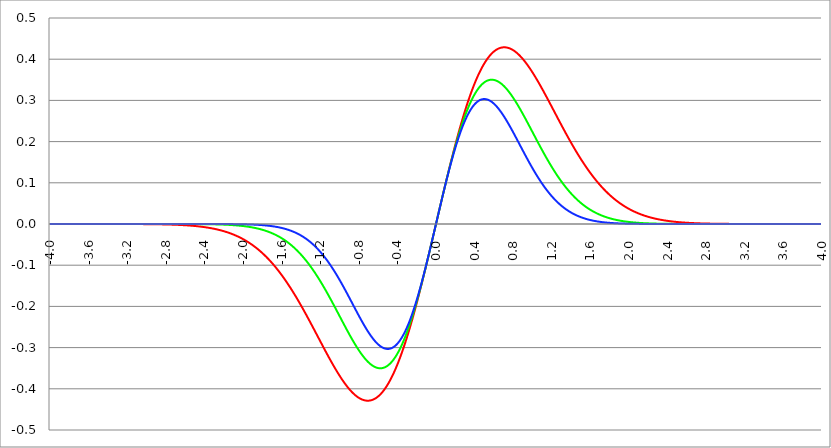
| Category | Series 1 | Series 0 | Series 2 |
|---|---|---|---|
| -4.0 | 0 | 0 | 0 |
| -3.996 | 0 | 0 | 0 |
| -3.992 | 0 | 0 | 0 |
| -3.988 | 0 | 0 | 0 |
| -3.984 | 0 | 0 | 0 |
| -3.98 | 0 | 0 | 0 |
| -3.976 | 0 | 0 | 0 |
| -3.972 | 0 | 0 | 0 |
| -3.968 | 0 | 0 | 0 |
| -3.964 | 0 | 0 | 0 |
| -3.96 | 0 | 0 | 0 |
| -3.956 | 0 | 0 | 0 |
| -3.952 | 0 | 0 | 0 |
| -3.948 | 0 | 0 | 0 |
| -3.944 | 0 | 0 | 0 |
| -3.94 | 0 | 0 | 0 |
| -3.936 | 0 | 0 | 0 |
| -3.932 | 0 | 0 | 0 |
| -3.928 | 0 | 0 | 0 |
| -3.924 | 0 | 0 | 0 |
| -3.92 | 0 | 0 | 0 |
| -3.916 | 0 | 0 | 0 |
| -3.912 | 0 | 0 | 0 |
| -3.908 | 0 | 0 | 0 |
| -3.904 | 0 | 0 | 0 |
| -3.9 | 0 | 0 | 0 |
| -3.896 | 0 | 0 | 0 |
| -3.892 | 0 | 0 | 0 |
| -3.888 | 0 | 0 | 0 |
| -3.884 | 0 | 0 | 0 |
| -3.88 | 0 | 0 | 0 |
| -3.876 | 0 | 0 | 0 |
| -3.872 | 0 | 0 | 0 |
| -3.868 | 0 | 0 | 0 |
| -3.864 | 0 | 0 | 0 |
| -3.86 | 0 | 0 | 0 |
| -3.856 | 0 | 0 | 0 |
| -3.852 | 0 | 0 | 0 |
| -3.848 | 0 | 0 | 0 |
| -3.844 | 0 | 0 | 0 |
| -3.84 | 0 | 0 | 0 |
| -3.836 | 0 | 0 | 0 |
| -3.832 | 0 | 0 | 0 |
| -3.828 | 0 | 0 | 0 |
| -3.824 | 0 | 0 | 0 |
| -3.82 | 0 | 0 | 0 |
| -3.816 | 0 | 0 | 0 |
| -3.812 | 0 | 0 | 0 |
| -3.808 | 0 | 0 | 0 |
| -3.804 | 0 | 0 | 0 |
| -3.8 | 0 | 0 | 0 |
| -3.796 | 0 | 0 | 0 |
| -3.792 | 0 | 0 | 0 |
| -3.788 | 0 | 0 | 0 |
| -3.784 | 0 | 0 | 0 |
| -3.78 | 0 | 0 | 0 |
| -3.776 | 0 | 0 | 0 |
| -3.772 | 0 | 0 | 0 |
| -3.768 | 0 | 0 | 0 |
| -3.764 | 0 | 0 | 0 |
| -3.76 | 0 | 0 | 0 |
| -3.756 | 0 | 0 | 0 |
| -3.752 | 0 | 0 | 0 |
| -3.748 | 0 | 0 | 0 |
| -3.744 | 0 | 0 | 0 |
| -3.74 | 0 | 0 | 0 |
| -3.736 | 0 | 0 | 0 |
| -3.732 | 0 | 0 | 0 |
| -3.728 | 0 | 0 | 0 |
| -3.724 | 0 | 0 | 0 |
| -3.72 | 0 | 0 | 0 |
| -3.716 | 0 | 0 | 0 |
| -3.712 | 0 | 0 | 0 |
| -3.708 | 0 | 0 | 0 |
| -3.704 | 0 | 0 | 0 |
| -3.7 | 0 | 0 | 0 |
| -3.696 | 0 | 0 | 0 |
| -3.692 | 0 | 0 | 0 |
| -3.688 | 0 | 0 | 0 |
| -3.684 | 0 | 0 | 0 |
| -3.68 | 0 | 0 | 0 |
| -3.676 | 0 | 0 | 0 |
| -3.672 | 0 | 0 | 0 |
| -3.668 | 0 | 0 | 0 |
| -3.664 | 0 | 0 | 0 |
| -3.66 | 0 | 0 | 0 |
| -3.656 | 0 | 0 | 0 |
| -3.652 | 0 | 0 | 0 |
| -3.648 | 0 | 0 | 0 |
| -3.644 | 0 | 0 | 0 |
| -3.64 | 0 | 0 | 0 |
| -3.636 | 0 | 0 | 0 |
| -3.632 | 0 | 0 | 0 |
| -3.628 | 0 | 0 | 0 |
| -3.624 | 0 | 0 | 0 |
| -3.62 | 0 | 0 | 0 |
| -3.616 | 0 | 0 | 0 |
| -3.612 | 0 | 0 | 0 |
| -3.608 | 0 | 0 | 0 |
| -3.604 | 0 | 0 | 0 |
| -3.6 | 0 | 0 | 0 |
| -3.596 | 0 | 0 | 0 |
| -3.592 | 0 | 0 | 0 |
| -3.588 | 0 | 0 | 0 |
| -3.584 | 0 | 0 | 0 |
| -3.58 | 0 | 0 | 0 |
| -3.576 | 0 | 0 | 0 |
| -3.572 | 0 | 0 | 0 |
| -3.568 | 0 | 0 | 0 |
| -3.564 | 0 | 0 | 0 |
| -3.56 | 0 | 0 | 0 |
| -3.556 | 0 | 0 | 0 |
| -3.552 | 0 | 0 | 0 |
| -3.548 | 0 | 0 | 0 |
| -3.544 | 0 | 0 | 0 |
| -3.54 | 0 | 0 | 0 |
| -3.536 | 0 | 0 | 0 |
| -3.532 | 0 | 0 | 0 |
| -3.528 | 0 | 0 | 0 |
| -3.524 | 0 | 0 | 0 |
| -3.52 | 0 | 0 | 0 |
| -3.516 | 0 | 0 | 0 |
| -3.512 | 0 | 0 | 0 |
| -3.508 | 0 | 0 | 0 |
| -3.504 | 0 | 0 | 0 |
| -3.5 | 0 | 0 | 0 |
| -3.496 | 0 | 0 | 0 |
| -3.492 | 0 | 0 | 0 |
| -3.488 | 0 | 0 | 0 |
| -3.484 | 0 | 0 | 0 |
| -3.48 | 0 | 0 | 0 |
| -3.476 | 0 | 0 | 0 |
| -3.472 | 0 | 0 | 0 |
| -3.467999999999999 | 0 | 0 | 0 |
| -3.463999999999999 | 0 | 0 | 0 |
| -3.459999999999999 | 0 | 0 | 0 |
| -3.455999999999999 | 0 | 0 | 0 |
| -3.451999999999999 | 0 | 0 | 0 |
| -3.447999999999999 | 0 | 0 | 0 |
| -3.443999999999999 | 0 | 0 | 0 |
| -3.439999999999999 | 0 | 0 | 0 |
| -3.435999999999999 | 0 | 0 | 0 |
| -3.431999999999999 | 0 | 0 | 0 |
| -3.427999999999999 | 0 | 0 | 0 |
| -3.423999999999999 | 0 | 0 | 0 |
| -3.419999999999999 | 0 | 0 | 0 |
| -3.415999999999999 | 0 | 0 | 0 |
| -3.411999999999999 | 0 | 0 | 0 |
| -3.407999999999999 | 0 | 0 | 0 |
| -3.403999999999999 | 0 | 0 | 0 |
| -3.399999999999999 | 0 | 0 | 0 |
| -3.395999999999999 | 0 | 0 | 0 |
| -3.391999999999999 | 0 | 0 | 0 |
| -3.387999999999999 | 0 | 0 | 0 |
| -3.383999999999999 | 0 | 0 | 0 |
| -3.379999999999999 | 0 | 0 | 0 |
| -3.375999999999999 | 0 | 0 | 0 |
| -3.371999999999999 | 0 | 0 | 0 |
| -3.367999999999999 | 0 | 0 | 0 |
| -3.363999999999999 | 0 | 0 | 0 |
| -3.359999999999999 | 0 | 0 | 0 |
| -3.355999999999999 | 0 | 0 | 0 |
| -3.351999999999999 | 0 | 0 | 0 |
| -3.347999999999999 | 0 | 0 | 0 |
| -3.343999999999999 | 0 | 0 | 0 |
| -3.339999999999999 | 0 | 0 | 0 |
| -3.335999999999999 | 0 | 0 | 0 |
| -3.331999999999999 | 0 | 0 | 0 |
| -3.327999999999999 | 0 | 0 | 0 |
| -3.323999999999999 | 0 | 0 | 0 |
| -3.319999999999999 | 0 | 0 | 0 |
| -3.315999999999999 | 0 | 0 | 0 |
| -3.311999999999999 | 0 | 0 | 0 |
| -3.307999999999999 | 0 | 0 | 0 |
| -3.303999999999999 | 0 | 0 | 0 |
| -3.299999999999999 | 0 | 0 | 0 |
| -3.295999999999999 | 0 | 0 | 0 |
| -3.291999999999999 | 0 | 0 | 0 |
| -3.288 | 0 | 0 | 0 |
| -3.284 | 0 | 0 | 0 |
| -3.279999999999999 | 0 | 0 | 0 |
| -3.275999999999999 | 0 | 0 | 0 |
| -3.271999999999999 | 0 | 0 | 0 |
| -3.268 | 0 | 0 | 0 |
| -3.264 | 0 | 0 | 0 |
| -3.259999999999999 | 0 | 0 | 0 |
| -3.255999999999999 | 0 | 0 | 0 |
| -3.251999999999999 | 0 | 0 | 0 |
| -3.248 | 0 | 0 | 0 |
| -3.244 | 0 | 0 | 0 |
| -3.239999999999999 | 0 | 0 | 0 |
| -3.235999999999999 | 0 | 0 | 0 |
| -3.231999999999999 | 0 | 0 | 0 |
| -3.228 | 0 | 0 | 0 |
| -3.224 | 0 | 0 | 0 |
| -3.219999999999999 | 0 | 0 | 0 |
| -3.215999999999999 | 0 | 0 | 0 |
| -3.211999999999999 | 0 | 0 | 0 |
| -3.208 | 0 | 0 | 0 |
| -3.204 | 0 | 0 | 0 |
| -3.199999999999999 | 0 | 0 | 0 |
| -3.195999999999999 | 0 | 0 | 0 |
| -3.191999999999999 | 0 | 0 | 0 |
| -3.188 | 0 | 0 | 0 |
| -3.184 | 0 | 0 | 0 |
| -3.179999999999999 | 0 | 0 | 0 |
| -3.175999999999999 | 0 | 0 | 0 |
| -3.171999999999999 | 0 | 0 | 0 |
| -3.168 | 0 | 0 | 0 |
| -3.164 | 0 | 0 | 0 |
| -3.159999999999999 | 0 | 0 | 0 |
| -3.155999999999999 | 0 | 0 | 0 |
| -3.151999999999999 | 0 | 0 | 0 |
| -3.148 | 0 | 0 | 0 |
| -3.144 | 0 | 0 | 0 |
| -3.139999999999999 | 0 | 0 | 0 |
| -3.135999999999999 | 0 | 0 | 0 |
| -3.131999999999999 | 0 | 0 | 0 |
| -3.128 | 0 | 0 | 0 |
| -3.124 | 0 | 0 | 0 |
| -3.119999999999999 | 0 | 0 | 0 |
| -3.115999999999999 | 0 | 0 | 0 |
| -3.111999999999999 | 0 | 0 | 0 |
| -3.108 | 0 | 0 | 0 |
| -3.104 | 0 | 0 | 0 |
| -3.099999999999999 | 0 | 0 | 0 |
| -3.095999999999999 | 0 | 0 | 0 |
| -3.091999999999999 | 0 | 0 | 0 |
| -3.088 | 0 | 0 | 0 |
| -3.084 | 0 | 0 | 0 |
| -3.079999999999999 | 0 | 0 | 0 |
| -3.075999999999999 | 0 | 0 | 0 |
| -3.071999999999999 | 0 | 0 | 0 |
| -3.068 | 0 | 0 | 0 |
| -3.064 | 0 | 0 | 0 |
| -3.059999999999999 | 0 | 0 | 0 |
| -3.055999999999999 | 0 | 0 | 0 |
| -3.051999999999999 | 0 | 0 | 0 |
| -3.048 | 0 | 0 | 0 |
| -3.044 | 0 | 0 | 0 |
| -3.039999999999999 | 0 | 0 | 0 |
| -3.035999999999999 | 0 | 0 | 0 |
| -3.031999999999999 | 0 | 0 | 0 |
| -3.028 | 0 | 0 | 0 |
| -3.024 | 0 | 0 | 0 |
| -3.019999999999999 | 0 | 0 | 0 |
| -3.015999999999999 | 0 | 0 | 0 |
| -3.011999999999999 | 0 | 0 | 0 |
| -3.008 | 0 | 0 | 0 |
| -3.004 | 0 | 0 | 0 |
| -2.999999999999999 | 0 | 0 | 0 |
| -2.995999999999999 | 0 | 0 | 0 |
| -2.991999999999999 | 0 | 0 | 0 |
| -2.988 | 0 | 0 | 0 |
| -2.984 | 0 | 0 | 0 |
| -2.979999999999999 | 0 | 0 | 0 |
| -2.975999999999999 | 0 | 0 | 0 |
| -2.971999999999999 | 0 | 0 | 0 |
| -2.968 | 0 | 0 | 0 |
| -2.964 | 0 | 0 | 0 |
| -2.959999999999999 | 0 | 0 | 0 |
| -2.955999999999999 | 0 | 0 | 0 |
| -2.951999999999999 | 0 | 0 | 0 |
| -2.948 | 0 | 0 | 0 |
| -2.944 | -0.001 | 0 | 0 |
| -2.939999999999999 | -0.001 | 0 | 0 |
| -2.935999999999999 | -0.001 | 0 | 0 |
| -2.931999999999999 | -0.001 | 0 | 0 |
| -2.928 | -0.001 | 0 | 0 |
| -2.924 | -0.001 | 0 | 0 |
| -2.919999999999999 | -0.001 | 0 | 0 |
| -2.915999999999999 | -0.001 | 0 | 0 |
| -2.911999999999999 | -0.001 | 0 | 0 |
| -2.908 | -0.001 | 0 | 0 |
| -2.904 | -0.001 | 0 | 0 |
| -2.899999999999999 | -0.001 | 0 | 0 |
| -2.895999999999999 | -0.001 | 0 | 0 |
| -2.891999999999999 | -0.001 | 0 | 0 |
| -2.887999999999999 | -0.001 | 0 | 0 |
| -2.883999999999999 | -0.001 | 0 | 0 |
| -2.879999999999999 | -0.001 | 0 | 0 |
| -2.875999999999999 | -0.001 | 0 | 0 |
| -2.871999999999999 | -0.001 | 0 | 0 |
| -2.867999999999999 | -0.001 | 0 | 0 |
| -2.863999999999999 | -0.001 | 0 | 0 |
| -2.859999999999999 | -0.001 | 0 | 0 |
| -2.855999999999999 | -0.001 | 0 | 0 |
| -2.851999999999999 | -0.001 | 0 | 0 |
| -2.847999999999999 | -0.001 | 0 | 0 |
| -2.843999999999999 | -0.001 | 0 | 0 |
| -2.839999999999999 | -0.001 | 0 | 0 |
| -2.835999999999999 | -0.001 | 0 | 0 |
| -2.831999999999999 | -0.001 | 0 | 0 |
| -2.827999999999999 | -0.001 | 0 | 0 |
| -2.823999999999999 | -0.001 | 0 | 0 |
| -2.819999999999999 | -0.001 | 0 | 0 |
| -2.815999999999999 | -0.001 | 0 | 0 |
| -2.811999999999999 | -0.001 | 0 | 0 |
| -2.807999999999999 | -0.001 | 0 | 0 |
| -2.803999999999999 | -0.001 | 0 | 0 |
| -2.799999999999999 | -0.001 | 0 | 0 |
| -2.795999999999999 | -0.001 | 0 | 0 |
| -2.791999999999999 | -0.001 | 0 | 0 |
| -2.787999999999999 | -0.001 | 0 | 0 |
| -2.783999999999999 | -0.001 | 0 | 0 |
| -2.779999999999999 | -0.001 | 0 | 0 |
| -2.775999999999999 | -0.001 | 0 | 0 |
| -2.771999999999999 | -0.001 | 0 | 0 |
| -2.767999999999999 | -0.001 | 0 | 0 |
| -2.763999999999999 | -0.001 | 0 | 0 |
| -2.759999999999999 | -0.001 | 0 | 0 |
| -2.755999999999999 | -0.001 | 0 | 0 |
| -2.751999999999999 | -0.001 | 0 | 0 |
| -2.747999999999999 | -0.001 | 0 | 0 |
| -2.743999999999999 | -0.001 | 0 | 0 |
| -2.739999999999999 | -0.002 | 0 | 0 |
| -2.735999999999999 | -0.002 | 0 | 0 |
| -2.731999999999999 | -0.002 | 0 | 0 |
| -2.727999999999999 | -0.002 | 0 | 0 |
| -2.723999999999999 | -0.002 | 0 | 0 |
| -2.719999999999999 | -0.002 | 0 | 0 |
| -2.715999999999999 | -0.002 | 0 | 0 |
| -2.711999999999999 | -0.002 | 0 | 0 |
| -2.707999999999999 | -0.002 | 0 | 0 |
| -2.703999999999999 | -0.002 | 0 | 0 |
| -2.699999999999999 | -0.002 | 0 | 0 |
| -2.695999999999999 | -0.002 | 0 | 0 |
| -2.691999999999999 | -0.002 | 0 | 0 |
| -2.687999999999999 | -0.002 | 0 | 0 |
| -2.683999999999999 | -0.002 | 0 | 0 |
| -2.679999999999999 | -0.002 | 0 | 0 |
| -2.675999999999999 | -0.002 | 0 | 0 |
| -2.671999999999999 | -0.002 | 0 | 0 |
| -2.667999999999999 | -0.002 | 0 | 0 |
| -2.663999999999999 | -0.002 | 0 | 0 |
| -2.659999999999999 | -0.002 | 0 | 0 |
| -2.655999999999999 | -0.002 | 0 | 0 |
| -2.651999999999999 | -0.002 | 0 | 0 |
| -2.647999999999999 | -0.002 | 0 | 0 |
| -2.643999999999999 | -0.002 | 0 | 0 |
| -2.639999999999999 | -0.002 | 0 | 0 |
| -2.635999999999999 | -0.003 | 0 | 0 |
| -2.631999999999999 | -0.003 | 0 | 0 |
| -2.627999999999999 | -0.003 | 0 | 0 |
| -2.623999999999999 | -0.003 | 0 | 0 |
| -2.619999999999999 | -0.003 | 0 | 0 |
| -2.615999999999999 | -0.003 | 0 | 0 |
| -2.611999999999999 | -0.003 | 0 | 0 |
| -2.607999999999999 | -0.003 | 0 | 0 |
| -2.603999999999999 | -0.003 | 0 | 0 |
| -2.599999999999999 | -0.003 | 0 | 0 |
| -2.595999999999999 | -0.003 | 0 | 0 |
| -2.591999999999999 | -0.003 | 0 | 0 |
| -2.587999999999999 | -0.003 | 0 | 0 |
| -2.583999999999999 | -0.003 | 0 | 0 |
| -2.579999999999999 | -0.003 | 0 | 0 |
| -2.575999999999999 | -0.003 | 0 | 0 |
| -2.571999999999999 | -0.003 | 0 | 0 |
| -2.567999999999999 | -0.004 | 0 | 0 |
| -2.563999999999999 | -0.004 | 0 | 0 |
| -2.559999999999999 | -0.004 | 0 | 0 |
| -2.555999999999999 | -0.004 | 0 | 0 |
| -2.551999999999999 | -0.004 | 0 | 0 |
| -2.547999999999999 | -0.004 | 0 | 0 |
| -2.543999999999999 | -0.004 | 0 | 0 |
| -2.539999999999999 | -0.004 | 0 | 0 |
| -2.535999999999999 | -0.004 | 0 | 0 |
| -2.531999999999999 | -0.004 | 0 | 0 |
| -2.527999999999999 | -0.004 | 0 | 0 |
| -2.523999999999999 | -0.004 | 0 | 0 |
| -2.519999999999999 | -0.004 | 0 | 0 |
| -2.515999999999999 | -0.004 | 0 | 0 |
| -2.511999999999999 | -0.005 | 0 | 0 |
| -2.507999999999999 | -0.005 | 0 | 0 |
| -2.503999999999999 | -0.005 | 0 | 0 |
| -2.499999999999999 | -0.005 | 0 | 0 |
| -2.495999999999999 | -0.005 | 0 | 0 |
| -2.491999999999999 | -0.005 | 0 | 0 |
| -2.487999999999999 | -0.005 | 0 | 0 |
| -2.483999999999999 | -0.005 | 0 | 0 |
| -2.479999999999999 | -0.005 | 0 | 0 |
| -2.475999999999999 | -0.005 | 0 | 0 |
| -2.471999999999999 | -0.005 | 0 | 0 |
| -2.467999999999999 | -0.006 | 0 | 0 |
| -2.463999999999999 | -0.006 | 0 | 0 |
| -2.459999999999999 | -0.006 | 0 | 0 |
| -2.455999999999999 | -0.006 | 0 | 0 |
| -2.451999999999999 | -0.006 | 0 | 0 |
| -2.447999999999999 | -0.006 | 0 | 0 |
| -2.443999999999999 | -0.006 | 0 | 0 |
| -2.439999999999999 | -0.006 | 0 | 0 |
| -2.435999999999999 | -0.006 | 0 | 0 |
| -2.431999999999999 | -0.007 | 0 | 0 |
| -2.427999999999999 | -0.007 | 0 | 0 |
| -2.423999999999999 | -0.007 | 0 | 0 |
| -2.419999999999999 | -0.007 | 0 | 0 |
| -2.415999999999999 | -0.007 | 0 | 0 |
| -2.411999999999999 | -0.007 | 0 | 0 |
| -2.407999999999999 | -0.007 | 0 | 0 |
| -2.403999999999999 | -0.007 | 0 | 0 |
| -2.399999999999999 | -0.008 | 0 | 0 |
| -2.395999999999999 | -0.008 | 0 | 0 |
| -2.391999999999999 | -0.008 | 0 | 0 |
| -2.387999999999999 | -0.008 | 0 | 0 |
| -2.383999999999999 | -0.008 | 0 | 0 |
| -2.379999999999999 | -0.008 | 0 | 0 |
| -2.375999999999999 | -0.008 | 0 | 0 |
| -2.371999999999999 | -0.009 | -0.001 | 0 |
| -2.367999999999998 | -0.009 | -0.001 | 0 |
| -2.363999999999998 | -0.009 | -0.001 | 0 |
| -2.359999999999998 | -0.009 | -0.001 | 0 |
| -2.355999999999998 | -0.009 | -0.001 | 0 |
| -2.351999999999998 | -0.009 | -0.001 | 0 |
| -2.347999999999998 | -0.009 | -0.001 | 0 |
| -2.343999999999998 | -0.01 | -0.001 | 0 |
| -2.339999999999998 | -0.01 | -0.001 | 0 |
| -2.335999999999998 | -0.01 | -0.001 | 0 |
| -2.331999999999998 | -0.01 | -0.001 | 0 |
| -2.327999999999998 | -0.01 | -0.001 | 0 |
| -2.323999999999998 | -0.01 | -0.001 | 0 |
| -2.319999999999998 | -0.011 | -0.001 | 0 |
| -2.315999999999998 | -0.011 | -0.001 | 0 |
| -2.311999999999998 | -0.011 | -0.001 | 0 |
| -2.307999999999998 | -0.011 | -0.001 | 0 |
| -2.303999999999998 | -0.011 | -0.001 | 0 |
| -2.299999999999998 | -0.012 | -0.001 | 0 |
| -2.295999999999998 | -0.012 | -0.001 | 0 |
| -2.291999999999998 | -0.012 | -0.001 | 0 |
| -2.287999999999998 | -0.012 | -0.001 | 0 |
| -2.283999999999998 | -0.012 | -0.001 | 0 |
| -2.279999999999998 | -0.013 | -0.001 | 0 |
| -2.275999999999998 | -0.013 | -0.001 | 0 |
| -2.271999999999998 | -0.013 | -0.001 | 0 |
| -2.267999999999998 | -0.013 | -0.001 | 0 |
| -2.263999999999998 | -0.013 | -0.001 | 0 |
| -2.259999999999998 | -0.014 | -0.001 | 0 |
| -2.255999999999998 | -0.014 | -0.001 | 0 |
| -2.251999999999998 | -0.014 | -0.001 | 0 |
| -2.247999999999998 | -0.014 | -0.001 | 0 |
| -2.243999999999998 | -0.015 | -0.001 | 0 |
| -2.239999999999998 | -0.015 | -0.001 | 0 |
| -2.235999999999998 | -0.015 | -0.001 | 0 |
| -2.231999999999998 | -0.015 | -0.001 | 0 |
| -2.227999999999998 | -0.016 | -0.001 | 0 |
| -2.223999999999998 | -0.016 | -0.001 | 0 |
| -2.219999999999998 | -0.016 | -0.001 | 0 |
| -2.215999999999998 | -0.016 | -0.001 | 0 |
| -2.211999999999998 | -0.017 | -0.001 | 0 |
| -2.207999999999998 | -0.017 | -0.001 | 0 |
| -2.203999999999998 | -0.017 | -0.002 | 0 |
| -2.199999999999998 | -0.017 | -0.002 | 0 |
| -2.195999999999998 | -0.018 | -0.002 | 0 |
| -2.191999999999998 | -0.018 | -0.002 | 0 |
| -2.187999999999998 | -0.018 | -0.002 | 0 |
| -2.183999999999998 | -0.019 | -0.002 | 0 |
| -2.179999999999998 | -0.019 | -0.002 | 0 |
| -2.175999999999998 | -0.019 | -0.002 | 0 |
| -2.171999999999998 | -0.019 | -0.002 | 0 |
| -2.167999999999998 | -0.02 | -0.002 | 0 |
| -2.163999999999998 | -0.02 | -0.002 | 0 |
| -2.159999999999998 | -0.02 | -0.002 | 0 |
| -2.155999999999998 | -0.021 | -0.002 | 0 |
| -2.151999999999998 | -0.021 | -0.002 | 0 |
| -2.147999999999998 | -0.021 | -0.002 | 0 |
| -2.143999999999998 | -0.022 | -0.002 | 0 |
| -2.139999999999998 | -0.022 | -0.002 | 0 |
| -2.135999999999998 | -0.022 | -0.002 | 0 |
| -2.131999999999998 | -0.023 | -0.002 | 0 |
| -2.127999999999998 | -0.023 | -0.002 | 0 |
| -2.123999999999998 | -0.023 | -0.002 | 0 |
| -2.119999999999998 | -0.024 | -0.003 | 0 |
| -2.115999999999998 | -0.024 | -0.003 | 0 |
| -2.111999999999998 | -0.024 | -0.003 | 0 |
| -2.107999999999998 | -0.025 | -0.003 | 0 |
| -2.103999999999998 | -0.025 | -0.003 | 0 |
| -2.099999999999998 | -0.026 | -0.003 | 0 |
| -2.095999999999998 | -0.026 | -0.003 | 0 |
| -2.091999999999998 | -0.026 | -0.003 | 0 |
| -2.087999999999998 | -0.027 | -0.003 | 0 |
| -2.083999999999998 | -0.027 | -0.003 | 0 |
| -2.079999999999998 | -0.027 | -0.003 | 0 |
| -2.075999999999998 | -0.028 | -0.003 | 0 |
| -2.071999999999998 | -0.028 | -0.003 | 0 |
| -2.067999999999998 | -0.029 | -0.003 | 0 |
| -2.063999999999998 | -0.029 | -0.003 | 0 |
| -2.059999999999998 | -0.03 | -0.004 | 0 |
| -2.055999999999998 | -0.03 | -0.004 | 0 |
| -2.051999999999998 | -0.03 | -0.004 | 0 |
| -2.047999999999998 | -0.031 | -0.004 | 0 |
| -2.043999999999998 | -0.031 | -0.004 | 0 |
| -2.039999999999998 | -0.032 | -0.004 | 0 |
| -2.035999999999998 | -0.032 | -0.004 | -0.001 |
| -2.031999999999998 | -0.033 | -0.004 | -0.001 |
| -2.027999999999998 | -0.033 | -0.004 | -0.001 |
| -2.023999999999998 | -0.034 | -0.004 | -0.001 |
| -2.019999999999998 | -0.034 | -0.004 | -0.001 |
| -2.015999999999998 | -0.035 | -0.005 | -0.001 |
| -2.011999999999998 | -0.035 | -0.005 | -0.001 |
| -2.007999999999998 | -0.036 | -0.005 | -0.001 |
| -2.003999999999998 | -0.036 | -0.005 | -0.001 |
| -1.999999999999998 | -0.037 | -0.005 | -0.001 |
| -1.995999999999998 | -0.037 | -0.005 | -0.001 |
| -1.991999999999998 | -0.038 | -0.005 | -0.001 |
| -1.987999999999998 | -0.038 | -0.005 | -0.001 |
| -1.983999999999998 | -0.039 | -0.005 | -0.001 |
| -1.979999999999998 | -0.039 | -0.006 | -0.001 |
| -1.975999999999998 | -0.04 | -0.006 | -0.001 |
| -1.971999999999998 | -0.04 | -0.006 | -0.001 |
| -1.967999999999998 | -0.041 | -0.006 | -0.001 |
| -1.963999999999998 | -0.041 | -0.006 | -0.001 |
| -1.959999999999998 | -0.042 | -0.006 | -0.001 |
| -1.955999999999998 | -0.043 | -0.006 | -0.001 |
| -1.951999999999998 | -0.043 | -0.006 | -0.001 |
| -1.947999999999998 | -0.044 | -0.007 | -0.001 |
| -1.943999999999998 | -0.044 | -0.007 | -0.001 |
| -1.939999999999998 | -0.045 | -0.007 | -0.001 |
| -1.935999999999998 | -0.046 | -0.007 | -0.001 |
| -1.931999999999998 | -0.046 | -0.007 | -0.001 |
| -1.927999999999998 | -0.047 | -0.007 | -0.001 |
| -1.923999999999998 | -0.047 | -0.007 | -0.001 |
| -1.919999999999998 | -0.048 | -0.008 | -0.001 |
| -1.915999999999998 | -0.049 | -0.008 | -0.001 |
| -1.911999999999998 | -0.049 | -0.008 | -0.001 |
| -1.907999999999998 | -0.05 | -0.008 | -0.001 |
| -1.903999999999998 | -0.051 | -0.008 | -0.001 |
| -1.899999999999998 | -0.051 | -0.008 | -0.001 |
| -1.895999999999998 | -0.052 | -0.009 | -0.001 |
| -1.891999999999998 | -0.053 | -0.009 | -0.001 |
| -1.887999999999998 | -0.053 | -0.009 | -0.002 |
| -1.883999999999998 | -0.054 | -0.009 | -0.002 |
| -1.879999999999998 | -0.055 | -0.009 | -0.002 |
| -1.875999999999998 | -0.056 | -0.01 | -0.002 |
| -1.871999999999998 | -0.056 | -0.01 | -0.002 |
| -1.867999999999998 | -0.057 | -0.01 | -0.002 |
| -1.863999999999998 | -0.058 | -0.01 | -0.002 |
| -1.859999999999998 | -0.058 | -0.01 | -0.002 |
| -1.855999999999998 | -0.059 | -0.011 | -0.002 |
| -1.851999999999998 | -0.06 | -0.011 | -0.002 |
| -1.847999999999998 | -0.061 | -0.011 | -0.002 |
| -1.843999999999998 | -0.062 | -0.011 | -0.002 |
| -1.839999999999998 | -0.062 | -0.011 | -0.002 |
| -1.835999999999998 | -0.063 | -0.012 | -0.002 |
| -1.831999999999998 | -0.064 | -0.012 | -0.002 |
| -1.827999999999998 | -0.065 | -0.012 | -0.002 |
| -1.823999999999998 | -0.065 | -0.012 | -0.002 |
| -1.819999999999998 | -0.066 | -0.013 | -0.002 |
| -1.815999999999998 | -0.067 | -0.013 | -0.002 |
| -1.811999999999998 | -0.068 | -0.013 | -0.003 |
| -1.807999999999998 | -0.069 | -0.013 | -0.003 |
| -1.803999999999998 | -0.07 | -0.014 | -0.003 |
| -1.799999999999998 | -0.07 | -0.014 | -0.003 |
| -1.795999999999998 | -0.071 | -0.014 | -0.003 |
| -1.791999999999998 | -0.072 | -0.015 | -0.003 |
| -1.787999999999998 | -0.073 | -0.015 | -0.003 |
| -1.783999999999998 | -0.074 | -0.015 | -0.003 |
| -1.779999999999998 | -0.075 | -0.015 | -0.003 |
| -1.775999999999998 | -0.076 | -0.016 | -0.003 |
| -1.771999999999998 | -0.077 | -0.016 | -0.003 |
| -1.767999999999998 | -0.078 | -0.016 | -0.003 |
| -1.763999999999998 | -0.079 | -0.017 | -0.003 |
| -1.759999999999998 | -0.079 | -0.017 | -0.004 |
| -1.755999999999998 | -0.08 | -0.017 | -0.004 |
| -1.751999999999998 | -0.081 | -0.018 | -0.004 |
| -1.747999999999998 | -0.082 | -0.018 | -0.004 |
| -1.743999999999998 | -0.083 | -0.018 | -0.004 |
| -1.739999999999998 | -0.084 | -0.019 | -0.004 |
| -1.735999999999998 | -0.085 | -0.019 | -0.004 |
| -1.731999999999998 | -0.086 | -0.019 | -0.004 |
| -1.727999999999998 | -0.087 | -0.02 | -0.004 |
| -1.723999999999998 | -0.088 | -0.02 | -0.005 |
| -1.719999999999998 | -0.089 | -0.02 | -0.005 |
| -1.715999999999998 | -0.09 | -0.021 | -0.005 |
| -1.711999999999998 | -0.091 | -0.021 | -0.005 |
| -1.707999999999998 | -0.092 | -0.021 | -0.005 |
| -1.703999999999998 | -0.093 | -0.022 | -0.005 |
| -1.699999999999998 | -0.094 | -0.022 | -0.005 |
| -1.695999999999998 | -0.096 | -0.023 | -0.005 |
| -1.691999999999998 | -0.097 | -0.023 | -0.006 |
| -1.687999999999998 | -0.098 | -0.024 | -0.006 |
| -1.683999999999998 | -0.099 | -0.024 | -0.006 |
| -1.679999999999998 | -0.1 | -0.024 | -0.006 |
| -1.675999999999998 | -0.101 | -0.025 | -0.006 |
| -1.671999999999998 | -0.102 | -0.025 | -0.006 |
| -1.667999999999998 | -0.103 | -0.026 | -0.006 |
| -1.663999999999998 | -0.104 | -0.026 | -0.007 |
| -1.659999999999998 | -0.106 | -0.027 | -0.007 |
| -1.655999999999998 | -0.107 | -0.027 | -0.007 |
| -1.651999999999998 | -0.108 | -0.028 | -0.007 |
| -1.647999999999998 | -0.109 | -0.028 | -0.007 |
| -1.643999999999998 | -0.11 | -0.029 | -0.007 |
| -1.639999999999998 | -0.111 | -0.029 | -0.008 |
| -1.635999999999998 | -0.113 | -0.03 | -0.008 |
| -1.631999999999998 | -0.114 | -0.03 | -0.008 |
| -1.627999999999998 | -0.115 | -0.031 | -0.008 |
| -1.623999999999998 | -0.116 | -0.031 | -0.008 |
| -1.619999999999998 | -0.117 | -0.032 | -0.009 |
| -1.615999999999998 | -0.119 | -0.032 | -0.009 |
| -1.611999999999998 | -0.12 | -0.033 | -0.009 |
| -1.607999999999998 | -0.121 | -0.033 | -0.009 |
| -1.603999999999998 | -0.122 | -0.034 | -0.009 |
| -1.599999999999998 | -0.124 | -0.034 | -0.01 |
| -1.595999999999998 | -0.125 | -0.035 | -0.01 |
| -1.591999999999998 | -0.126 | -0.036 | -0.01 |
| -1.587999999999998 | -0.128 | -0.036 | -0.01 |
| -1.583999999999998 | -0.129 | -0.037 | -0.01 |
| -1.579999999999998 | -0.13 | -0.037 | -0.011 |
| -1.575999999999998 | -0.131 | -0.038 | -0.011 |
| -1.571999999999998 | -0.133 | -0.039 | -0.011 |
| -1.567999999999998 | -0.134 | -0.039 | -0.011 |
| -1.563999999999998 | -0.135 | -0.04 | -0.012 |
| -1.559999999999998 | -0.137 | -0.041 | -0.012 |
| -1.555999999999998 | -0.138 | -0.041 | -0.012 |
| -1.551999999999998 | -0.14 | -0.042 | -0.013 |
| -1.547999999999998 | -0.141 | -0.043 | -0.013 |
| -1.543999999999998 | -0.142 | -0.043 | -0.013 |
| -1.539999999999998 | -0.144 | -0.044 | -0.013 |
| -1.535999999999998 | -0.145 | -0.045 | -0.014 |
| -1.531999999999998 | -0.147 | -0.045 | -0.014 |
| -1.527999999999998 | -0.148 | -0.046 | -0.014 |
| -1.523999999999998 | -0.149 | -0.047 | -0.015 |
| -1.519999999999998 | -0.151 | -0.048 | -0.015 |
| -1.515999999999998 | -0.152 | -0.048 | -0.015 |
| -1.511999999999998 | -0.154 | -0.049 | -0.016 |
| -1.507999999999998 | -0.155 | -0.05 | -0.016 |
| -1.503999999999998 | -0.157 | -0.051 | -0.016 |
| -1.499999999999998 | -0.158 | -0.051 | -0.017 |
| -1.495999999999998 | -0.16 | -0.052 | -0.017 |
| -1.491999999999998 | -0.161 | -0.053 | -0.017 |
| -1.487999999999998 | -0.163 | -0.054 | -0.018 |
| -1.483999999999998 | -0.164 | -0.055 | -0.018 |
| -1.479999999999998 | -0.166 | -0.055 | -0.019 |
| -1.475999999999998 | -0.167 | -0.056 | -0.019 |
| -1.471999999999998 | -0.169 | -0.057 | -0.019 |
| -1.467999999999998 | -0.17 | -0.058 | -0.02 |
| -1.463999999999998 | -0.172 | -0.059 | -0.02 |
| -1.459999999999998 | -0.173 | -0.06 | -0.021 |
| -1.455999999999998 | -0.175 | -0.061 | -0.021 |
| -1.451999999999998 | -0.176 | -0.061 | -0.021 |
| -1.447999999999998 | -0.178 | -0.062 | -0.022 |
| -1.443999999999998 | -0.179 | -0.063 | -0.022 |
| -1.439999999999998 | -0.181 | -0.064 | -0.023 |
| -1.435999999999998 | -0.183 | -0.065 | -0.023 |
| -1.431999999999998 | -0.184 | -0.066 | -0.024 |
| -1.427999999999998 | -0.186 | -0.067 | -0.024 |
| -1.423999999999998 | -0.187 | -0.068 | -0.025 |
| -1.419999999999998 | -0.189 | -0.069 | -0.025 |
| -1.415999999999998 | -0.191 | -0.07 | -0.026 |
| -1.411999999999998 | -0.192 | -0.071 | -0.026 |
| -1.407999999999998 | -0.194 | -0.072 | -0.027 |
| -1.403999999999998 | -0.196 | -0.073 | -0.027 |
| -1.399999999999998 | -0.197 | -0.074 | -0.028 |
| -1.395999999999998 | -0.199 | -0.075 | -0.028 |
| -1.391999999999998 | -0.201 | -0.076 | -0.029 |
| -1.387999999999998 | -0.202 | -0.077 | -0.029 |
| -1.383999999999998 | -0.204 | -0.078 | -0.03 |
| -1.379999999999998 | -0.205 | -0.079 | -0.031 |
| -1.375999999999998 | -0.207 | -0.08 | -0.031 |
| -1.371999999999998 | -0.209 | -0.081 | -0.032 |
| -1.367999999999998 | -0.211 | -0.083 | -0.032 |
| -1.363999999999998 | -0.212 | -0.084 | -0.033 |
| -1.359999999999998 | -0.214 | -0.085 | -0.034 |
| -1.355999999999998 | -0.216 | -0.086 | -0.034 |
| -1.351999999999998 | -0.217 | -0.087 | -0.035 |
| -1.347999999999998 | -0.219 | -0.088 | -0.036 |
| -1.343999999999998 | -0.221 | -0.089 | -0.036 |
| -1.339999999999998 | -0.222 | -0.091 | -0.037 |
| -1.335999999999998 | -0.224 | -0.092 | -0.038 |
| -1.331999999999998 | -0.226 | -0.093 | -0.038 |
| -1.327999999999998 | -0.228 | -0.094 | -0.039 |
| -1.323999999999998 | -0.229 | -0.095 | -0.04 |
| -1.319999999999998 | -0.231 | -0.097 | -0.04 |
| -1.315999999999998 | -0.233 | -0.098 | -0.041 |
| -1.311999999999998 | -0.235 | -0.099 | -0.042 |
| -1.307999999999998 | -0.236 | -0.1 | -0.043 |
| -1.303999999999998 | -0.238 | -0.102 | -0.043 |
| -1.299999999999998 | -0.24 | -0.103 | -0.044 |
| -1.295999999999998 | -0.242 | -0.104 | -0.045 |
| -1.291999999999998 | -0.243 | -0.106 | -0.046 |
| -1.287999999999998 | -0.245 | -0.107 | -0.047 |
| -1.283999999999998 | -0.247 | -0.108 | -0.047 |
| -1.279999999999998 | -0.249 | -0.11 | -0.048 |
| -1.275999999999998 | -0.25 | -0.111 | -0.049 |
| -1.271999999999998 | -0.252 | -0.112 | -0.05 |
| -1.267999999999998 | -0.254 | -0.114 | -0.051 |
| -1.263999999999998 | -0.256 | -0.115 | -0.052 |
| -1.259999999999998 | -0.258 | -0.116 | -0.053 |
| -1.255999999999998 | -0.259 | -0.118 | -0.054 |
| -1.251999999999998 | -0.261 | -0.119 | -0.054 |
| -1.247999999999998 | -0.263 | -0.121 | -0.055 |
| -1.243999999999998 | -0.265 | -0.122 | -0.056 |
| -1.239999999999998 | -0.266 | -0.124 | -0.057 |
| -1.235999999999998 | -0.268 | -0.125 | -0.058 |
| -1.231999999999998 | -0.27 | -0.126 | -0.059 |
| -1.227999999999998 | -0.272 | -0.128 | -0.06 |
| -1.223999999999998 | -0.274 | -0.129 | -0.061 |
| -1.219999999999998 | -0.275 | -0.131 | -0.062 |
| -1.215999999999998 | -0.277 | -0.132 | -0.063 |
| -1.211999999999998 | -0.279 | -0.134 | -0.064 |
| -1.207999999999998 | -0.281 | -0.135 | -0.065 |
| -1.203999999999998 | -0.283 | -0.137 | -0.066 |
| -1.199999999999997 | -0.284 | -0.138 | -0.067 |
| -1.195999999999997 | -0.286 | -0.14 | -0.068 |
| -1.191999999999997 | -0.288 | -0.141 | -0.07 |
| -1.187999999999997 | -0.29 | -0.143 | -0.071 |
| -1.183999999999997 | -0.291 | -0.145 | -0.072 |
| -1.179999999999997 | -0.293 | -0.146 | -0.073 |
| -1.175999999999997 | -0.295 | -0.148 | -0.074 |
| -1.171999999999997 | -0.297 | -0.149 | -0.075 |
| -1.167999999999997 | -0.299 | -0.151 | -0.076 |
| -1.163999999999997 | -0.3 | -0.153 | -0.077 |
| -1.159999999999997 | -0.302 | -0.154 | -0.079 |
| -1.155999999999997 | -0.304 | -0.156 | -0.08 |
| -1.151999999999997 | -0.306 | -0.157 | -0.081 |
| -1.147999999999997 | -0.307 | -0.159 | -0.082 |
| -1.143999999999997 | -0.309 | -0.161 | -0.083 |
| -1.139999999999997 | -0.311 | -0.162 | -0.085 |
| -1.135999999999997 | -0.313 | -0.164 | -0.086 |
| -1.131999999999997 | -0.314 | -0.166 | -0.087 |
| -1.127999999999997 | -0.316 | -0.167 | -0.089 |
| -1.123999999999997 | -0.318 | -0.169 | -0.09 |
| -1.119999999999997 | -0.319 | -0.171 | -0.091 |
| -1.115999999999997 | -0.321 | -0.172 | -0.092 |
| -1.111999999999997 | -0.323 | -0.174 | -0.094 |
| -1.107999999999997 | -0.325 | -0.176 | -0.095 |
| -1.103999999999997 | -0.326 | -0.177 | -0.096 |
| -1.099999999999997 | -0.328 | -0.179 | -0.098 |
| -1.095999999999997 | -0.33 | -0.181 | -0.099 |
| -1.091999999999997 | -0.331 | -0.183 | -0.101 |
| -1.087999999999997 | -0.333 | -0.184 | -0.102 |
| -1.083999999999997 | -0.335 | -0.186 | -0.103 |
| -1.079999999999997 | -0.336 | -0.188 | -0.105 |
| -1.075999999999997 | -0.338 | -0.189 | -0.106 |
| -1.071999999999997 | -0.34 | -0.191 | -0.108 |
| -1.067999999999997 | -0.341 | -0.193 | -0.109 |
| -1.063999999999997 | -0.343 | -0.195 | -0.111 |
| -1.059999999999997 | -0.345 | -0.196 | -0.112 |
| -1.055999999999997 | -0.346 | -0.198 | -0.114 |
| -1.051999999999997 | -0.348 | -0.2 | -0.115 |
| -1.047999999999997 | -0.349 | -0.202 | -0.117 |
| -1.043999999999997 | -0.351 | -0.204 | -0.118 |
| -1.039999999999997 | -0.353 | -0.205 | -0.12 |
| -1.035999999999997 | -0.354 | -0.207 | -0.121 |
| -1.031999999999997 | -0.356 | -0.209 | -0.123 |
| -1.027999999999997 | -0.357 | -0.211 | -0.124 |
| -1.023999999999997 | -0.359 | -0.212 | -0.126 |
| -1.019999999999997 | -0.36 | -0.214 | -0.127 |
| -1.015999999999997 | -0.362 | -0.216 | -0.129 |
| -1.011999999999997 | -0.363 | -0.218 | -0.131 |
| -1.007999999999997 | -0.365 | -0.22 | -0.132 |
| -1.003999999999997 | -0.366 | -0.221 | -0.134 |
| -0.999999999999997 | -0.368 | -0.223 | -0.135 |
| -0.995999999999997 | -0.369 | -0.225 | -0.137 |
| -0.991999999999997 | -0.371 | -0.227 | -0.139 |
| -0.987999999999997 | -0.372 | -0.228 | -0.14 |
| -0.983999999999997 | -0.374 | -0.23 | -0.142 |
| -0.979999999999997 | -0.375 | -0.232 | -0.144 |
| -0.975999999999997 | -0.376 | -0.234 | -0.145 |
| -0.971999999999997 | -0.378 | -0.236 | -0.147 |
| -0.967999999999997 | -0.379 | -0.237 | -0.149 |
| -0.963999999999997 | -0.381 | -0.239 | -0.15 |
| -0.959999999999997 | -0.382 | -0.241 | -0.152 |
| -0.955999999999997 | -0.383 | -0.243 | -0.154 |
| -0.951999999999997 | -0.385 | -0.244 | -0.155 |
| -0.947999999999997 | -0.386 | -0.246 | -0.157 |
| -0.943999999999997 | -0.387 | -0.248 | -0.159 |
| -0.939999999999997 | -0.388 | -0.25 | -0.161 |
| -0.935999999999997 | -0.39 | -0.252 | -0.162 |
| -0.931999999999997 | -0.391 | -0.253 | -0.164 |
| -0.927999999999997 | -0.392 | -0.255 | -0.166 |
| -0.923999999999997 | -0.393 | -0.257 | -0.168 |
| -0.919999999999997 | -0.395 | -0.258 | -0.169 |
| -0.915999999999997 | -0.396 | -0.26 | -0.171 |
| -0.911999999999997 | -0.397 | -0.262 | -0.173 |
| -0.907999999999997 | -0.398 | -0.264 | -0.175 |
| -0.903999999999997 | -0.399 | -0.265 | -0.176 |
| -0.899999999999997 | -0.4 | -0.267 | -0.178 |
| -0.895999999999997 | -0.401 | -0.269 | -0.18 |
| -0.891999999999997 | -0.403 | -0.27 | -0.182 |
| -0.887999999999997 | -0.404 | -0.272 | -0.183 |
| -0.883999999999997 | -0.405 | -0.274 | -0.185 |
| -0.879999999999997 | -0.406 | -0.275 | -0.187 |
| -0.875999999999997 | -0.407 | -0.277 | -0.189 |
| -0.871999999999997 | -0.408 | -0.279 | -0.191 |
| -0.867999999999997 | -0.409 | -0.28 | -0.192 |
| -0.863999999999997 | -0.41 | -0.282 | -0.194 |
| -0.859999999999997 | -0.41 | -0.284 | -0.196 |
| -0.855999999999997 | -0.411 | -0.285 | -0.198 |
| -0.851999999999997 | -0.412 | -0.287 | -0.199 |
| -0.847999999999997 | -0.413 | -0.288 | -0.201 |
| -0.843999999999997 | -0.414 | -0.29 | -0.203 |
| -0.839999999999997 | -0.415 | -0.291 | -0.205 |
| -0.835999999999997 | -0.416 | -0.293 | -0.207 |
| -0.831999999999997 | -0.416 | -0.295 | -0.208 |
| -0.827999999999997 | -0.417 | -0.296 | -0.21 |
| -0.823999999999997 | -0.418 | -0.298 | -0.212 |
| -0.819999999999997 | -0.419 | -0.299 | -0.214 |
| -0.815999999999997 | -0.419 | -0.301 | -0.215 |
| -0.811999999999997 | -0.42 | -0.302 | -0.217 |
| -0.807999999999997 | -0.421 | -0.303 | -0.219 |
| -0.803999999999997 | -0.421 | -0.305 | -0.221 |
| -0.799999999999997 | -0.422 | -0.306 | -0.222 |
| -0.795999999999997 | -0.422 | -0.308 | -0.224 |
| -0.791999999999997 | -0.423 | -0.309 | -0.226 |
| -0.787999999999997 | -0.424 | -0.31 | -0.228 |
| -0.783999999999997 | -0.424 | -0.312 | -0.229 |
| -0.779999999999997 | -0.424 | -0.313 | -0.231 |
| -0.775999999999997 | -0.425 | -0.314 | -0.233 |
| -0.771999999999997 | -0.425 | -0.316 | -0.234 |
| -0.767999999999997 | -0.426 | -0.317 | -0.236 |
| -0.763999999999997 | -0.426 | -0.318 | -0.238 |
| -0.759999999999997 | -0.427 | -0.32 | -0.239 |
| -0.755999999999997 | -0.427 | -0.321 | -0.241 |
| -0.751999999999997 | -0.427 | -0.322 | -0.243 |
| -0.747999999999997 | -0.427 | -0.323 | -0.244 |
| -0.743999999999997 | -0.428 | -0.324 | -0.246 |
| -0.739999999999997 | -0.428 | -0.325 | -0.248 |
| -0.735999999999997 | -0.428 | -0.327 | -0.249 |
| -0.731999999999997 | -0.428 | -0.328 | -0.251 |
| -0.727999999999997 | -0.429 | -0.329 | -0.252 |
| -0.723999999999997 | -0.429 | -0.33 | -0.254 |
| -0.719999999999997 | -0.429 | -0.331 | -0.255 |
| -0.715999999999997 | -0.429 | -0.332 | -0.257 |
| -0.711999999999997 | -0.429 | -0.333 | -0.258 |
| -0.707999999999997 | -0.429 | -0.334 | -0.26 |
| -0.703999999999997 | -0.429 | -0.335 | -0.261 |
| -0.699999999999997 | -0.429 | -0.336 | -0.263 |
| -0.695999999999997 | -0.429 | -0.337 | -0.264 |
| -0.691999999999997 | -0.429 | -0.337 | -0.266 |
| -0.687999999999997 | -0.429 | -0.338 | -0.267 |
| -0.683999999999997 | -0.428 | -0.339 | -0.268 |
| -0.679999999999997 | -0.428 | -0.34 | -0.27 |
| -0.675999999999997 | -0.428 | -0.341 | -0.271 |
| -0.671999999999997 | -0.428 | -0.341 | -0.272 |
| -0.667999999999997 | -0.428 | -0.342 | -0.274 |
| -0.663999999999997 | -0.427 | -0.343 | -0.275 |
| -0.659999999999997 | -0.427 | -0.343 | -0.276 |
| -0.655999999999997 | -0.427 | -0.344 | -0.277 |
| -0.651999999999997 | -0.426 | -0.345 | -0.279 |
| -0.647999999999997 | -0.426 | -0.345 | -0.28 |
| -0.643999999999997 | -0.425 | -0.346 | -0.281 |
| -0.639999999999997 | -0.425 | -0.346 | -0.282 |
| -0.635999999999997 | -0.424 | -0.347 | -0.283 |
| -0.631999999999997 | -0.424 | -0.347 | -0.284 |
| -0.627999999999997 | -0.423 | -0.348 | -0.285 |
| -0.623999999999997 | -0.423 | -0.348 | -0.286 |
| -0.619999999999997 | -0.422 | -0.348 | -0.287 |
| -0.615999999999997 | -0.421 | -0.349 | -0.288 |
| -0.611999999999997 | -0.421 | -0.349 | -0.289 |
| -0.607999999999997 | -0.42 | -0.349 | -0.29 |
| -0.603999999999997 | -0.419 | -0.349 | -0.291 |
| -0.599999999999997 | -0.419 | -0.35 | -0.292 |
| -0.595999999999997 | -0.418 | -0.35 | -0.293 |
| -0.591999999999997 | -0.417 | -0.35 | -0.294 |
| -0.587999999999997 | -0.416 | -0.35 | -0.294 |
| -0.583999999999997 | -0.415 | -0.35 | -0.295 |
| -0.579999999999997 | -0.414 | -0.35 | -0.296 |
| -0.575999999999997 | -0.413 | -0.35 | -0.297 |
| -0.571999999999997 | -0.412 | -0.35 | -0.297 |
| -0.567999999999997 | -0.411 | -0.35 | -0.298 |
| -0.563999999999997 | -0.41 | -0.35 | -0.299 |
| -0.559999999999997 | -0.409 | -0.35 | -0.299 |
| -0.555999999999997 | -0.408 | -0.35 | -0.3 |
| -0.551999999999997 | -0.407 | -0.349 | -0.3 |
| -0.547999999999997 | -0.406 | -0.349 | -0.301 |
| -0.543999999999997 | -0.405 | -0.349 | -0.301 |
| -0.539999999999997 | -0.403 | -0.349 | -0.301 |
| -0.535999999999997 | -0.402 | -0.348 | -0.302 |
| -0.531999999999997 | -0.401 | -0.348 | -0.302 |
| -0.527999999999997 | -0.4 | -0.348 | -0.302 |
| -0.523999999999997 | -0.398 | -0.347 | -0.303 |
| -0.519999999999997 | -0.397 | -0.347 | -0.303 |
| -0.515999999999997 | -0.395 | -0.346 | -0.303 |
| -0.511999999999997 | -0.394 | -0.346 | -0.303 |
| -0.507999999999997 | -0.392 | -0.345 | -0.303 |
| -0.503999999999997 | -0.391 | -0.344 | -0.303 |
| -0.499999999999997 | -0.389 | -0.344 | -0.303 |
| -0.495999999999997 | -0.388 | -0.343 | -0.303 |
| -0.491999999999997 | -0.386 | -0.342 | -0.303 |
| -0.487999999999997 | -0.385 | -0.341 | -0.303 |
| -0.483999999999997 | -0.383 | -0.341 | -0.303 |
| -0.479999999999997 | -0.381 | -0.34 | -0.303 |
| -0.475999999999997 | -0.379 | -0.339 | -0.303 |
| -0.471999999999997 | -0.378 | -0.338 | -0.302 |
| -0.467999999999997 | -0.376 | -0.337 | -0.302 |
| -0.463999999999997 | -0.374 | -0.336 | -0.302 |
| -0.459999999999997 | -0.372 | -0.335 | -0.301 |
| -0.455999999999997 | -0.37 | -0.334 | -0.301 |
| -0.451999999999997 | -0.368 | -0.333 | -0.3 |
| -0.447999999999997 | -0.367 | -0.332 | -0.3 |
| -0.443999999999997 | -0.365 | -0.33 | -0.299 |
| -0.439999999999997 | -0.363 | -0.329 | -0.299 |
| -0.435999999999997 | -0.361 | -0.328 | -0.298 |
| -0.431999999999997 | -0.358 | -0.327 | -0.297 |
| -0.427999999999997 | -0.356 | -0.325 | -0.297 |
| -0.423999999999997 | -0.354 | -0.324 | -0.296 |
| -0.419999999999997 | -0.352 | -0.322 | -0.295 |
| -0.415999999999997 | -0.35 | -0.321 | -0.294 |
| -0.411999999999997 | -0.348 | -0.319 | -0.293 |
| -0.407999999999997 | -0.345 | -0.318 | -0.292 |
| -0.403999999999997 | -0.343 | -0.316 | -0.291 |
| -0.399999999999997 | -0.341 | -0.315 | -0.29 |
| -0.395999999999997 | -0.339 | -0.313 | -0.289 |
| -0.391999999999997 | -0.336 | -0.311 | -0.288 |
| -0.387999999999997 | -0.334 | -0.31 | -0.287 |
| -0.383999999999997 | -0.331 | -0.308 | -0.286 |
| -0.379999999999997 | -0.329 | -0.306 | -0.285 |
| -0.375999999999997 | -0.326 | -0.304 | -0.283 |
| -0.371999999999997 | -0.324 | -0.302 | -0.282 |
| -0.367999999999997 | -0.321 | -0.3 | -0.281 |
| -0.363999999999997 | -0.319 | -0.298 | -0.279 |
| -0.359999999999997 | -0.316 | -0.296 | -0.278 |
| -0.355999999999997 | -0.314 | -0.294 | -0.276 |
| -0.351999999999997 | -0.311 | -0.292 | -0.275 |
| -0.347999999999997 | -0.308 | -0.29 | -0.273 |
| -0.343999999999997 | -0.306 | -0.288 | -0.272 |
| -0.339999999999997 | -0.303 | -0.286 | -0.27 |
| -0.335999999999997 | -0.3 | -0.284 | -0.268 |
| -0.331999999999997 | -0.297 | -0.281 | -0.266 |
| -0.327999999999997 | -0.295 | -0.279 | -0.265 |
| -0.323999999999997 | -0.292 | -0.277 | -0.263 |
| -0.319999999999997 | -0.289 | -0.274 | -0.261 |
| -0.315999999999997 | -0.286 | -0.272 | -0.259 |
| -0.311999999999997 | -0.283 | -0.27 | -0.257 |
| -0.307999999999997 | -0.28 | -0.267 | -0.255 |
| -0.303999999999997 | -0.277 | -0.265 | -0.253 |
| -0.299999999999997 | -0.274 | -0.262 | -0.251 |
| -0.295999999999997 | -0.271 | -0.26 | -0.248 |
| -0.291999999999997 | -0.268 | -0.257 | -0.246 |
| -0.287999999999997 | -0.265 | -0.254 | -0.244 |
| -0.283999999999997 | -0.262 | -0.252 | -0.242 |
| -0.279999999999997 | -0.259 | -0.249 | -0.239 |
| -0.275999999999997 | -0.256 | -0.246 | -0.237 |
| -0.271999999999997 | -0.253 | -0.243 | -0.235 |
| -0.267999999999997 | -0.249 | -0.241 | -0.232 |
| -0.263999999999997 | -0.246 | -0.238 | -0.23 |
| -0.259999999999997 | -0.243 | -0.235 | -0.227 |
| -0.255999999999997 | -0.24 | -0.232 | -0.225 |
| -0.251999999999997 | -0.236 | -0.229 | -0.222 |
| -0.247999999999997 | -0.233 | -0.226 | -0.219 |
| -0.243999999999997 | -0.23 | -0.223 | -0.217 |
| -0.239999999999997 | -0.227 | -0.22 | -0.214 |
| -0.235999999999997 | -0.223 | -0.217 | -0.211 |
| -0.231999999999997 | -0.22 | -0.214 | -0.208 |
| -0.227999999999997 | -0.216 | -0.211 | -0.205 |
| -0.223999999999997 | -0.213 | -0.208 | -0.203 |
| -0.219999999999997 | -0.21 | -0.205 | -0.2 |
| -0.215999999999997 | -0.206 | -0.201 | -0.197 |
| -0.211999999999997 | -0.203 | -0.198 | -0.194 |
| -0.207999999999997 | -0.199 | -0.195 | -0.191 |
| -0.203999999999997 | -0.196 | -0.192 | -0.188 |
| -0.199999999999997 | -0.192 | -0.188 | -0.185 |
| -0.195999999999997 | -0.189 | -0.185 | -0.182 |
| -0.191999999999997 | -0.185 | -0.182 | -0.178 |
| -0.187999999999997 | -0.181 | -0.178 | -0.175 |
| -0.183999999999997 | -0.178 | -0.175 | -0.172 |
| -0.179999999999997 | -0.174 | -0.171 | -0.169 |
| -0.175999999999997 | -0.171 | -0.168 | -0.165 |
| -0.171999999999997 | -0.167 | -0.165 | -0.162 |
| -0.167999999999997 | -0.163 | -0.161 | -0.159 |
| -0.163999999999997 | -0.16 | -0.158 | -0.155 |
| -0.159999999999997 | -0.156 | -0.154 | -0.152 |
| -0.155999999999997 | -0.152 | -0.15 | -0.149 |
| -0.151999999999997 | -0.149 | -0.147 | -0.145 |
| -0.147999999999997 | -0.145 | -0.143 | -0.142 |
| -0.143999999999997 | -0.141 | -0.14 | -0.138 |
| -0.139999999999997 | -0.137 | -0.136 | -0.135 |
| -0.135999999999997 | -0.134 | -0.132 | -0.131 |
| -0.131999999999997 | -0.13 | -0.129 | -0.127 |
| -0.127999999999997 | -0.126 | -0.125 | -0.124 |
| -0.123999999999997 | -0.122 | -0.121 | -0.12 |
| -0.119999999999997 | -0.118 | -0.117 | -0.117 |
| -0.115999999999997 | -0.114 | -0.114 | -0.113 |
| -0.111999999999997 | -0.111 | -0.11 | -0.109 |
| -0.107999999999997 | -0.107 | -0.106 | -0.106 |
| -0.103999999999997 | -0.103 | -0.102 | -0.102 |
| -0.0999999999999965 | -0.099 | -0.099 | -0.098 |
| -0.0959999999999965 | -0.095 | -0.095 | -0.094 |
| -0.0919999999999965 | -0.091 | -0.091 | -0.09 |
| -0.0879999999999965 | -0.087 | -0.087 | -0.087 |
| -0.0839999999999965 | -0.083 | -0.083 | -0.083 |
| -0.0799999999999965 | -0.079 | -0.079 | -0.079 |
| -0.0759999999999965 | -0.076 | -0.075 | -0.075 |
| -0.0719999999999965 | -0.072 | -0.071 | -0.071 |
| -0.0679999999999965 | -0.068 | -0.068 | -0.067 |
| -0.0639999999999965 | -0.064 | -0.064 | -0.063 |
| -0.0599999999999965 | -0.06 | -0.06 | -0.06 |
| -0.0559999999999965 | -0.056 | -0.056 | -0.056 |
| -0.0519999999999965 | -0.052 | -0.052 | -0.052 |
| -0.0479999999999965 | -0.048 | -0.048 | -0.048 |
| -0.0439999999999965 | -0.044 | -0.044 | -0.044 |
| -0.0399999999999965 | -0.04 | -0.04 | -0.04 |
| -0.0359999999999965 | -0.036 | -0.036 | -0.036 |
| -0.0319999999999965 | -0.032 | -0.032 | -0.032 |
| -0.0279999999999965 | -0.028 | -0.028 | -0.028 |
| -0.0239999999999965 | -0.024 | -0.024 | -0.024 |
| -0.0199999999999965 | -0.02 | -0.02 | -0.02 |
| -0.0159999999999965 | -0.016 | -0.016 | -0.016 |
| -0.0119999999999965 | -0.012 | -0.012 | -0.012 |
| -0.00799999999999647 | -0.008 | -0.008 | -0.008 |
| -0.00399999999999647 | -0.004 | -0.004 | -0.004 |
| 3.52495810318487e-15 | 0 | 0 | 0 |
| 0.00400000000000352 | 0.004 | 0.004 | 0.004 |
| 0.00800000000000352 | 0.008 | 0.008 | 0.008 |
| 0.0120000000000035 | 0.012 | 0.012 | 0.012 |
| 0.0160000000000035 | 0.016 | 0.016 | 0.016 |
| 0.0200000000000035 | 0.02 | 0.02 | 0.02 |
| 0.0240000000000035 | 0.024 | 0.024 | 0.024 |
| 0.0280000000000035 | 0.028 | 0.028 | 0.028 |
| 0.0320000000000035 | 0.032 | 0.032 | 0.032 |
| 0.0360000000000035 | 0.036 | 0.036 | 0.036 |
| 0.0400000000000035 | 0.04 | 0.04 | 0.04 |
| 0.0440000000000035 | 0.044 | 0.044 | 0.044 |
| 0.0480000000000035 | 0.048 | 0.048 | 0.048 |
| 0.0520000000000035 | 0.052 | 0.052 | 0.052 |
| 0.0560000000000035 | 0.056 | 0.056 | 0.056 |
| 0.0600000000000035 | 0.06 | 0.06 | 0.06 |
| 0.0640000000000035 | 0.064 | 0.064 | 0.063 |
| 0.0680000000000035 | 0.068 | 0.068 | 0.067 |
| 0.0720000000000036 | 0.072 | 0.071 | 0.071 |
| 0.0760000000000036 | 0.076 | 0.075 | 0.075 |
| 0.0800000000000036 | 0.079 | 0.079 | 0.079 |
| 0.0840000000000036 | 0.083 | 0.083 | 0.083 |
| 0.0880000000000036 | 0.087 | 0.087 | 0.087 |
| 0.0920000000000036 | 0.091 | 0.091 | 0.09 |
| 0.0960000000000036 | 0.095 | 0.095 | 0.094 |
| 0.100000000000004 | 0.099 | 0.099 | 0.098 |
| 0.104000000000004 | 0.103 | 0.102 | 0.102 |
| 0.108000000000004 | 0.107 | 0.106 | 0.106 |
| 0.112000000000004 | 0.111 | 0.11 | 0.109 |
| 0.116000000000004 | 0.114 | 0.114 | 0.113 |
| 0.120000000000004 | 0.118 | 0.117 | 0.117 |
| 0.124000000000004 | 0.122 | 0.121 | 0.12 |
| 0.128000000000004 | 0.126 | 0.125 | 0.124 |
| 0.132000000000004 | 0.13 | 0.129 | 0.127 |
| 0.136000000000004 | 0.134 | 0.132 | 0.131 |
| 0.140000000000004 | 0.137 | 0.136 | 0.135 |
| 0.144000000000004 | 0.141 | 0.14 | 0.138 |
| 0.148000000000004 | 0.145 | 0.143 | 0.142 |
| 0.152000000000004 | 0.149 | 0.147 | 0.145 |
| 0.156000000000004 | 0.152 | 0.15 | 0.149 |
| 0.160000000000004 | 0.156 | 0.154 | 0.152 |
| 0.164000000000004 | 0.16 | 0.158 | 0.155 |
| 0.168000000000004 | 0.163 | 0.161 | 0.159 |
| 0.172000000000004 | 0.167 | 0.165 | 0.162 |
| 0.176000000000004 | 0.171 | 0.168 | 0.165 |
| 0.180000000000004 | 0.174 | 0.171 | 0.169 |
| 0.184000000000004 | 0.178 | 0.175 | 0.172 |
| 0.188000000000004 | 0.181 | 0.178 | 0.175 |
| 0.192000000000004 | 0.185 | 0.182 | 0.178 |
| 0.196000000000004 | 0.189 | 0.185 | 0.182 |
| 0.200000000000004 | 0.192 | 0.188 | 0.185 |
| 0.204000000000004 | 0.196 | 0.192 | 0.188 |
| 0.208000000000004 | 0.199 | 0.195 | 0.191 |
| 0.212000000000004 | 0.203 | 0.198 | 0.194 |
| 0.216000000000004 | 0.206 | 0.201 | 0.197 |
| 0.220000000000004 | 0.21 | 0.205 | 0.2 |
| 0.224000000000004 | 0.213 | 0.208 | 0.203 |
| 0.228000000000004 | 0.216 | 0.211 | 0.205 |
| 0.232000000000004 | 0.22 | 0.214 | 0.208 |
| 0.236000000000004 | 0.223 | 0.217 | 0.211 |
| 0.240000000000004 | 0.227 | 0.22 | 0.214 |
| 0.244000000000004 | 0.23 | 0.223 | 0.217 |
| 0.248000000000004 | 0.233 | 0.226 | 0.219 |
| 0.252000000000004 | 0.236 | 0.229 | 0.222 |
| 0.256000000000004 | 0.24 | 0.232 | 0.225 |
| 0.260000000000004 | 0.243 | 0.235 | 0.227 |
| 0.264000000000004 | 0.246 | 0.238 | 0.23 |
| 0.268000000000004 | 0.249 | 0.241 | 0.232 |
| 0.272000000000004 | 0.253 | 0.243 | 0.235 |
| 0.276000000000004 | 0.256 | 0.246 | 0.237 |
| 0.280000000000004 | 0.259 | 0.249 | 0.239 |
| 0.284000000000004 | 0.262 | 0.252 | 0.242 |
| 0.288000000000004 | 0.265 | 0.254 | 0.244 |
| 0.292000000000004 | 0.268 | 0.257 | 0.246 |
| 0.296000000000004 | 0.271 | 0.26 | 0.248 |
| 0.300000000000004 | 0.274 | 0.262 | 0.251 |
| 0.304000000000004 | 0.277 | 0.265 | 0.253 |
| 0.308000000000004 | 0.28 | 0.267 | 0.255 |
| 0.312000000000004 | 0.283 | 0.27 | 0.257 |
| 0.316000000000004 | 0.286 | 0.272 | 0.259 |
| 0.320000000000004 | 0.289 | 0.274 | 0.261 |
| 0.324000000000004 | 0.292 | 0.277 | 0.263 |
| 0.328000000000004 | 0.295 | 0.279 | 0.265 |
| 0.332000000000004 | 0.297 | 0.281 | 0.266 |
| 0.336000000000004 | 0.3 | 0.284 | 0.268 |
| 0.340000000000004 | 0.303 | 0.286 | 0.27 |
| 0.344000000000004 | 0.306 | 0.288 | 0.272 |
| 0.348000000000004 | 0.308 | 0.29 | 0.273 |
| 0.352000000000004 | 0.311 | 0.292 | 0.275 |
| 0.356000000000004 | 0.314 | 0.294 | 0.276 |
| 0.360000000000004 | 0.316 | 0.296 | 0.278 |
| 0.364000000000004 | 0.319 | 0.298 | 0.279 |
| 0.368000000000004 | 0.321 | 0.3 | 0.281 |
| 0.372000000000004 | 0.324 | 0.302 | 0.282 |
| 0.376000000000004 | 0.326 | 0.304 | 0.283 |
| 0.380000000000004 | 0.329 | 0.306 | 0.285 |
| 0.384000000000004 | 0.331 | 0.308 | 0.286 |
| 0.388000000000004 | 0.334 | 0.31 | 0.287 |
| 0.392000000000004 | 0.336 | 0.311 | 0.288 |
| 0.396000000000004 | 0.339 | 0.313 | 0.289 |
| 0.400000000000004 | 0.341 | 0.315 | 0.29 |
| 0.404000000000004 | 0.343 | 0.316 | 0.291 |
| 0.408000000000004 | 0.345 | 0.318 | 0.292 |
| 0.412000000000004 | 0.348 | 0.319 | 0.293 |
| 0.416000000000004 | 0.35 | 0.321 | 0.294 |
| 0.420000000000004 | 0.352 | 0.322 | 0.295 |
| 0.424000000000004 | 0.354 | 0.324 | 0.296 |
| 0.428000000000004 | 0.356 | 0.325 | 0.297 |
| 0.432000000000004 | 0.358 | 0.327 | 0.297 |
| 0.436000000000004 | 0.361 | 0.328 | 0.298 |
| 0.440000000000004 | 0.363 | 0.329 | 0.299 |
| 0.444000000000004 | 0.365 | 0.33 | 0.299 |
| 0.448000000000004 | 0.367 | 0.332 | 0.3 |
| 0.452000000000004 | 0.368 | 0.333 | 0.3 |
| 0.456000000000004 | 0.37 | 0.334 | 0.301 |
| 0.460000000000004 | 0.372 | 0.335 | 0.301 |
| 0.464000000000004 | 0.374 | 0.336 | 0.302 |
| 0.468000000000004 | 0.376 | 0.337 | 0.302 |
| 0.472000000000004 | 0.378 | 0.338 | 0.302 |
| 0.476000000000004 | 0.379 | 0.339 | 0.303 |
| 0.480000000000004 | 0.381 | 0.34 | 0.303 |
| 0.484000000000004 | 0.383 | 0.341 | 0.303 |
| 0.488000000000004 | 0.385 | 0.341 | 0.303 |
| 0.492000000000004 | 0.386 | 0.342 | 0.303 |
| 0.496000000000004 | 0.388 | 0.343 | 0.303 |
| 0.500000000000004 | 0.389 | 0.344 | 0.303 |
| 0.504000000000004 | 0.391 | 0.344 | 0.303 |
| 0.508000000000004 | 0.392 | 0.345 | 0.303 |
| 0.512000000000004 | 0.394 | 0.346 | 0.303 |
| 0.516000000000004 | 0.395 | 0.346 | 0.303 |
| 0.520000000000004 | 0.397 | 0.347 | 0.303 |
| 0.524000000000004 | 0.398 | 0.347 | 0.303 |
| 0.528000000000004 | 0.4 | 0.348 | 0.302 |
| 0.532000000000004 | 0.401 | 0.348 | 0.302 |
| 0.536000000000004 | 0.402 | 0.348 | 0.302 |
| 0.540000000000004 | 0.403 | 0.349 | 0.301 |
| 0.544000000000004 | 0.405 | 0.349 | 0.301 |
| 0.548000000000004 | 0.406 | 0.349 | 0.301 |
| 0.552000000000004 | 0.407 | 0.349 | 0.3 |
| 0.556000000000004 | 0.408 | 0.35 | 0.3 |
| 0.560000000000004 | 0.409 | 0.35 | 0.299 |
| 0.564000000000004 | 0.41 | 0.35 | 0.299 |
| 0.568000000000004 | 0.411 | 0.35 | 0.298 |
| 0.572000000000004 | 0.412 | 0.35 | 0.297 |
| 0.576000000000004 | 0.413 | 0.35 | 0.297 |
| 0.580000000000004 | 0.414 | 0.35 | 0.296 |
| 0.584000000000004 | 0.415 | 0.35 | 0.295 |
| 0.588000000000004 | 0.416 | 0.35 | 0.294 |
| 0.592000000000004 | 0.417 | 0.35 | 0.294 |
| 0.596000000000004 | 0.418 | 0.35 | 0.293 |
| 0.600000000000004 | 0.419 | 0.35 | 0.292 |
| 0.604000000000004 | 0.419 | 0.349 | 0.291 |
| 0.608000000000004 | 0.42 | 0.349 | 0.29 |
| 0.612000000000004 | 0.421 | 0.349 | 0.289 |
| 0.616000000000004 | 0.421 | 0.349 | 0.288 |
| 0.620000000000004 | 0.422 | 0.348 | 0.287 |
| 0.624000000000004 | 0.423 | 0.348 | 0.286 |
| 0.628000000000004 | 0.423 | 0.348 | 0.285 |
| 0.632000000000004 | 0.424 | 0.347 | 0.284 |
| 0.636000000000004 | 0.424 | 0.347 | 0.283 |
| 0.640000000000004 | 0.425 | 0.346 | 0.282 |
| 0.644000000000004 | 0.425 | 0.346 | 0.281 |
| 0.648000000000004 | 0.426 | 0.345 | 0.28 |
| 0.652000000000004 | 0.426 | 0.345 | 0.279 |
| 0.656000000000004 | 0.427 | 0.344 | 0.277 |
| 0.660000000000004 | 0.427 | 0.343 | 0.276 |
| 0.664000000000004 | 0.427 | 0.343 | 0.275 |
| 0.668000000000004 | 0.428 | 0.342 | 0.274 |
| 0.672000000000004 | 0.428 | 0.341 | 0.272 |
| 0.676000000000004 | 0.428 | 0.341 | 0.271 |
| 0.680000000000004 | 0.428 | 0.34 | 0.27 |
| 0.684000000000004 | 0.428 | 0.339 | 0.268 |
| 0.688000000000004 | 0.429 | 0.338 | 0.267 |
| 0.692000000000004 | 0.429 | 0.337 | 0.266 |
| 0.696000000000004 | 0.429 | 0.337 | 0.264 |
| 0.700000000000004 | 0.429 | 0.336 | 0.263 |
| 0.704000000000004 | 0.429 | 0.335 | 0.261 |
| 0.708000000000004 | 0.429 | 0.334 | 0.26 |
| 0.712000000000004 | 0.429 | 0.333 | 0.258 |
| 0.716000000000004 | 0.429 | 0.332 | 0.257 |
| 0.720000000000004 | 0.429 | 0.331 | 0.255 |
| 0.724000000000004 | 0.429 | 0.33 | 0.254 |
| 0.728000000000004 | 0.429 | 0.329 | 0.252 |
| 0.732000000000004 | 0.428 | 0.328 | 0.251 |
| 0.736000000000004 | 0.428 | 0.327 | 0.249 |
| 0.740000000000004 | 0.428 | 0.325 | 0.248 |
| 0.744000000000004 | 0.428 | 0.324 | 0.246 |
| 0.748000000000004 | 0.427 | 0.323 | 0.244 |
| 0.752000000000004 | 0.427 | 0.322 | 0.243 |
| 0.756000000000004 | 0.427 | 0.321 | 0.241 |
| 0.760000000000004 | 0.427 | 0.32 | 0.239 |
| 0.764000000000004 | 0.426 | 0.318 | 0.238 |
| 0.768000000000004 | 0.426 | 0.317 | 0.236 |
| 0.772000000000004 | 0.425 | 0.316 | 0.234 |
| 0.776000000000004 | 0.425 | 0.314 | 0.233 |
| 0.780000000000004 | 0.424 | 0.313 | 0.231 |
| 0.784000000000004 | 0.424 | 0.312 | 0.229 |
| 0.788000000000004 | 0.424 | 0.31 | 0.228 |
| 0.792000000000004 | 0.423 | 0.309 | 0.226 |
| 0.796000000000004 | 0.422 | 0.308 | 0.224 |
| 0.800000000000004 | 0.422 | 0.306 | 0.222 |
| 0.804000000000004 | 0.421 | 0.305 | 0.221 |
| 0.808000000000004 | 0.421 | 0.303 | 0.219 |
| 0.812000000000004 | 0.42 | 0.302 | 0.217 |
| 0.816000000000004 | 0.419 | 0.301 | 0.215 |
| 0.820000000000004 | 0.419 | 0.299 | 0.214 |
| 0.824000000000004 | 0.418 | 0.298 | 0.212 |
| 0.828000000000004 | 0.417 | 0.296 | 0.21 |
| 0.832000000000004 | 0.416 | 0.295 | 0.208 |
| 0.836000000000004 | 0.416 | 0.293 | 0.207 |
| 0.840000000000004 | 0.415 | 0.291 | 0.205 |
| 0.844000000000004 | 0.414 | 0.29 | 0.203 |
| 0.848000000000004 | 0.413 | 0.288 | 0.201 |
| 0.852000000000004 | 0.412 | 0.287 | 0.199 |
| 0.856000000000004 | 0.411 | 0.285 | 0.198 |
| 0.860000000000004 | 0.41 | 0.284 | 0.196 |
| 0.864000000000004 | 0.41 | 0.282 | 0.194 |
| 0.868000000000004 | 0.409 | 0.28 | 0.192 |
| 0.872000000000004 | 0.408 | 0.279 | 0.191 |
| 0.876000000000004 | 0.407 | 0.277 | 0.189 |
| 0.880000000000004 | 0.406 | 0.275 | 0.187 |
| 0.884000000000004 | 0.405 | 0.274 | 0.185 |
| 0.888000000000004 | 0.404 | 0.272 | 0.183 |
| 0.892000000000004 | 0.403 | 0.27 | 0.182 |
| 0.896000000000004 | 0.401 | 0.269 | 0.18 |
| 0.900000000000004 | 0.4 | 0.267 | 0.178 |
| 0.904000000000004 | 0.399 | 0.265 | 0.176 |
| 0.908000000000004 | 0.398 | 0.264 | 0.175 |
| 0.912000000000004 | 0.397 | 0.262 | 0.173 |
| 0.916000000000004 | 0.396 | 0.26 | 0.171 |
| 0.920000000000004 | 0.395 | 0.258 | 0.169 |
| 0.924000000000004 | 0.393 | 0.257 | 0.168 |
| 0.928000000000004 | 0.392 | 0.255 | 0.166 |
| 0.932000000000004 | 0.391 | 0.253 | 0.164 |
| 0.936000000000004 | 0.39 | 0.252 | 0.162 |
| 0.940000000000004 | 0.388 | 0.25 | 0.161 |
| 0.944000000000004 | 0.387 | 0.248 | 0.159 |
| 0.948000000000004 | 0.386 | 0.246 | 0.157 |
| 0.952000000000004 | 0.385 | 0.244 | 0.155 |
| 0.956000000000004 | 0.383 | 0.243 | 0.154 |
| 0.960000000000004 | 0.382 | 0.241 | 0.152 |
| 0.964000000000004 | 0.381 | 0.239 | 0.15 |
| 0.968000000000004 | 0.379 | 0.237 | 0.149 |
| 0.972000000000004 | 0.378 | 0.236 | 0.147 |
| 0.976000000000004 | 0.376 | 0.234 | 0.145 |
| 0.980000000000004 | 0.375 | 0.232 | 0.144 |
| 0.984000000000004 | 0.374 | 0.23 | 0.142 |
| 0.988000000000004 | 0.372 | 0.228 | 0.14 |
| 0.992000000000004 | 0.371 | 0.227 | 0.139 |
| 0.996000000000004 | 0.369 | 0.225 | 0.137 |
| 1.000000000000004 | 0.368 | 0.223 | 0.135 |
| 1.004000000000004 | 0.366 | 0.221 | 0.134 |
| 1.008000000000004 | 0.365 | 0.22 | 0.132 |
| 1.012000000000004 | 0.363 | 0.218 | 0.131 |
| 1.016000000000004 | 0.362 | 0.216 | 0.129 |
| 1.020000000000004 | 0.36 | 0.214 | 0.127 |
| 1.024000000000004 | 0.359 | 0.212 | 0.126 |
| 1.028000000000004 | 0.357 | 0.211 | 0.124 |
| 1.032000000000004 | 0.356 | 0.209 | 0.123 |
| 1.036000000000004 | 0.354 | 0.207 | 0.121 |
| 1.040000000000004 | 0.353 | 0.205 | 0.12 |
| 1.044000000000004 | 0.351 | 0.204 | 0.118 |
| 1.048000000000004 | 0.349 | 0.202 | 0.117 |
| 1.052000000000004 | 0.348 | 0.2 | 0.115 |
| 1.056000000000004 | 0.346 | 0.198 | 0.114 |
| 1.060000000000004 | 0.345 | 0.196 | 0.112 |
| 1.064000000000004 | 0.343 | 0.195 | 0.111 |
| 1.068000000000004 | 0.341 | 0.193 | 0.109 |
| 1.072000000000004 | 0.34 | 0.191 | 0.108 |
| 1.076000000000004 | 0.338 | 0.189 | 0.106 |
| 1.080000000000004 | 0.336 | 0.188 | 0.105 |
| 1.084000000000004 | 0.335 | 0.186 | 0.103 |
| 1.088000000000004 | 0.333 | 0.184 | 0.102 |
| 1.092000000000004 | 0.331 | 0.183 | 0.101 |
| 1.096000000000004 | 0.33 | 0.181 | 0.099 |
| 1.100000000000004 | 0.328 | 0.179 | 0.098 |
| 1.104000000000004 | 0.326 | 0.177 | 0.096 |
| 1.108000000000004 | 0.325 | 0.176 | 0.095 |
| 1.112000000000004 | 0.323 | 0.174 | 0.094 |
| 1.116000000000004 | 0.321 | 0.172 | 0.092 |
| 1.120000000000004 | 0.319 | 0.171 | 0.091 |
| 1.124000000000004 | 0.318 | 0.169 | 0.09 |
| 1.128000000000004 | 0.316 | 0.167 | 0.089 |
| 1.132000000000004 | 0.314 | 0.166 | 0.087 |
| 1.136000000000004 | 0.313 | 0.164 | 0.086 |
| 1.140000000000004 | 0.311 | 0.162 | 0.085 |
| 1.144000000000004 | 0.309 | 0.161 | 0.083 |
| 1.148000000000004 | 0.307 | 0.159 | 0.082 |
| 1.152000000000004 | 0.306 | 0.157 | 0.081 |
| 1.156000000000004 | 0.304 | 0.156 | 0.08 |
| 1.160000000000004 | 0.302 | 0.154 | 0.079 |
| 1.164000000000004 | 0.3 | 0.153 | 0.077 |
| 1.168000000000004 | 0.299 | 0.151 | 0.076 |
| 1.172000000000004 | 0.297 | 0.149 | 0.075 |
| 1.176000000000004 | 0.295 | 0.148 | 0.074 |
| 1.180000000000004 | 0.293 | 0.146 | 0.073 |
| 1.184000000000004 | 0.291 | 0.145 | 0.072 |
| 1.188000000000004 | 0.29 | 0.143 | 0.071 |
| 1.192000000000004 | 0.288 | 0.141 | 0.07 |
| 1.196000000000004 | 0.286 | 0.14 | 0.068 |
| 1.200000000000004 | 0.284 | 0.138 | 0.067 |
| 1.204000000000004 | 0.283 | 0.137 | 0.066 |
| 1.208000000000004 | 0.281 | 0.135 | 0.065 |
| 1.212000000000004 | 0.279 | 0.134 | 0.064 |
| 1.216000000000004 | 0.277 | 0.132 | 0.063 |
| 1.220000000000004 | 0.275 | 0.131 | 0.062 |
| 1.224000000000004 | 0.274 | 0.129 | 0.061 |
| 1.228000000000004 | 0.272 | 0.128 | 0.06 |
| 1.232000000000004 | 0.27 | 0.126 | 0.059 |
| 1.236000000000004 | 0.268 | 0.125 | 0.058 |
| 1.240000000000004 | 0.266 | 0.124 | 0.057 |
| 1.244000000000004 | 0.265 | 0.122 | 0.056 |
| 1.248000000000004 | 0.263 | 0.121 | 0.055 |
| 1.252000000000004 | 0.261 | 0.119 | 0.054 |
| 1.256000000000004 | 0.259 | 0.118 | 0.054 |
| 1.260000000000004 | 0.258 | 0.116 | 0.053 |
| 1.264000000000004 | 0.256 | 0.115 | 0.052 |
| 1.268000000000004 | 0.254 | 0.114 | 0.051 |
| 1.272000000000004 | 0.252 | 0.112 | 0.05 |
| 1.276000000000004 | 0.25 | 0.111 | 0.049 |
| 1.280000000000004 | 0.249 | 0.11 | 0.048 |
| 1.284000000000004 | 0.247 | 0.108 | 0.047 |
| 1.288000000000004 | 0.245 | 0.107 | 0.047 |
| 1.292000000000004 | 0.243 | 0.106 | 0.046 |
| 1.296000000000004 | 0.242 | 0.104 | 0.045 |
| 1.300000000000004 | 0.24 | 0.103 | 0.044 |
| 1.304000000000004 | 0.238 | 0.102 | 0.043 |
| 1.308000000000004 | 0.236 | 0.1 | 0.043 |
| 1.312000000000004 | 0.235 | 0.099 | 0.042 |
| 1.316000000000004 | 0.233 | 0.098 | 0.041 |
| 1.320000000000004 | 0.231 | 0.097 | 0.04 |
| 1.324000000000004 | 0.229 | 0.095 | 0.04 |
| 1.328000000000004 | 0.228 | 0.094 | 0.039 |
| 1.332000000000004 | 0.226 | 0.093 | 0.038 |
| 1.336000000000004 | 0.224 | 0.092 | 0.038 |
| 1.340000000000004 | 0.222 | 0.091 | 0.037 |
| 1.344000000000004 | 0.221 | 0.089 | 0.036 |
| 1.348000000000004 | 0.219 | 0.088 | 0.036 |
| 1.352000000000004 | 0.217 | 0.087 | 0.035 |
| 1.356000000000004 | 0.216 | 0.086 | 0.034 |
| 1.360000000000004 | 0.214 | 0.085 | 0.034 |
| 1.364000000000004 | 0.212 | 0.084 | 0.033 |
| 1.368000000000004 | 0.211 | 0.083 | 0.032 |
| 1.372000000000004 | 0.209 | 0.081 | 0.032 |
| 1.376000000000004 | 0.207 | 0.08 | 0.031 |
| 1.380000000000004 | 0.205 | 0.079 | 0.031 |
| 1.384000000000004 | 0.204 | 0.078 | 0.03 |
| 1.388000000000005 | 0.202 | 0.077 | 0.029 |
| 1.392000000000004 | 0.201 | 0.076 | 0.029 |
| 1.396000000000004 | 0.199 | 0.075 | 0.028 |
| 1.400000000000005 | 0.197 | 0.074 | 0.028 |
| 1.404000000000005 | 0.196 | 0.073 | 0.027 |
| 1.408000000000005 | 0.194 | 0.072 | 0.027 |
| 1.412000000000005 | 0.192 | 0.071 | 0.026 |
| 1.416000000000005 | 0.191 | 0.07 | 0.026 |
| 1.420000000000005 | 0.189 | 0.069 | 0.025 |
| 1.424000000000005 | 0.187 | 0.068 | 0.025 |
| 1.428000000000005 | 0.186 | 0.067 | 0.024 |
| 1.432000000000005 | 0.184 | 0.066 | 0.024 |
| 1.436000000000005 | 0.183 | 0.065 | 0.023 |
| 1.440000000000005 | 0.181 | 0.064 | 0.023 |
| 1.444000000000005 | 0.179 | 0.063 | 0.022 |
| 1.448000000000005 | 0.178 | 0.062 | 0.022 |
| 1.452000000000005 | 0.176 | 0.061 | 0.021 |
| 1.456000000000005 | 0.175 | 0.061 | 0.021 |
| 1.460000000000005 | 0.173 | 0.06 | 0.021 |
| 1.464000000000005 | 0.172 | 0.059 | 0.02 |
| 1.468000000000005 | 0.17 | 0.058 | 0.02 |
| 1.472000000000005 | 0.169 | 0.057 | 0.019 |
| 1.476000000000005 | 0.167 | 0.056 | 0.019 |
| 1.480000000000005 | 0.166 | 0.055 | 0.019 |
| 1.484000000000005 | 0.164 | 0.055 | 0.018 |
| 1.488000000000005 | 0.163 | 0.054 | 0.018 |
| 1.492000000000005 | 0.161 | 0.053 | 0.017 |
| 1.496000000000005 | 0.16 | 0.052 | 0.017 |
| 1.500000000000005 | 0.158 | 0.051 | 0.017 |
| 1.504000000000005 | 0.157 | 0.051 | 0.016 |
| 1.508000000000005 | 0.155 | 0.05 | 0.016 |
| 1.512000000000005 | 0.154 | 0.049 | 0.016 |
| 1.516000000000005 | 0.152 | 0.048 | 0.015 |
| 1.520000000000005 | 0.151 | 0.048 | 0.015 |
| 1.524000000000005 | 0.149 | 0.047 | 0.015 |
| 1.528000000000005 | 0.148 | 0.046 | 0.014 |
| 1.532000000000005 | 0.147 | 0.045 | 0.014 |
| 1.536000000000005 | 0.145 | 0.045 | 0.014 |
| 1.540000000000005 | 0.144 | 0.044 | 0.013 |
| 1.544000000000005 | 0.142 | 0.043 | 0.013 |
| 1.548000000000005 | 0.141 | 0.043 | 0.013 |
| 1.552000000000005 | 0.14 | 0.042 | 0.013 |
| 1.556000000000005 | 0.138 | 0.041 | 0.012 |
| 1.560000000000005 | 0.137 | 0.041 | 0.012 |
| 1.564000000000005 | 0.135 | 0.04 | 0.012 |
| 1.568000000000005 | 0.134 | 0.039 | 0.011 |
| 1.572000000000005 | 0.133 | 0.039 | 0.011 |
| 1.576000000000005 | 0.131 | 0.038 | 0.011 |
| 1.580000000000005 | 0.13 | 0.037 | 0.011 |
| 1.584000000000005 | 0.129 | 0.037 | 0.01 |
| 1.588000000000005 | 0.128 | 0.036 | 0.01 |
| 1.592000000000005 | 0.126 | 0.036 | 0.01 |
| 1.596000000000005 | 0.125 | 0.035 | 0.01 |
| 1.600000000000005 | 0.124 | 0.034 | 0.01 |
| 1.604000000000005 | 0.122 | 0.034 | 0.009 |
| 1.608000000000005 | 0.121 | 0.033 | 0.009 |
| 1.612000000000005 | 0.12 | 0.033 | 0.009 |
| 1.616000000000005 | 0.119 | 0.032 | 0.009 |
| 1.620000000000005 | 0.117 | 0.032 | 0.009 |
| 1.624000000000005 | 0.116 | 0.031 | 0.008 |
| 1.628000000000005 | 0.115 | 0.031 | 0.008 |
| 1.632000000000005 | 0.114 | 0.03 | 0.008 |
| 1.636000000000005 | 0.113 | 0.03 | 0.008 |
| 1.640000000000005 | 0.111 | 0.029 | 0.008 |
| 1.644000000000005 | 0.11 | 0.029 | 0.007 |
| 1.648000000000005 | 0.109 | 0.028 | 0.007 |
| 1.652000000000005 | 0.108 | 0.028 | 0.007 |
| 1.656000000000005 | 0.107 | 0.027 | 0.007 |
| 1.660000000000005 | 0.106 | 0.027 | 0.007 |
| 1.664000000000005 | 0.104 | 0.026 | 0.007 |
| 1.668000000000005 | 0.103 | 0.026 | 0.006 |
| 1.672000000000005 | 0.102 | 0.025 | 0.006 |
| 1.676000000000005 | 0.101 | 0.025 | 0.006 |
| 1.680000000000005 | 0.1 | 0.024 | 0.006 |
| 1.684000000000005 | 0.099 | 0.024 | 0.006 |
| 1.688000000000005 | 0.098 | 0.024 | 0.006 |
| 1.692000000000005 | 0.097 | 0.023 | 0.006 |
| 1.696000000000005 | 0.096 | 0.023 | 0.005 |
| 1.700000000000005 | 0.094 | 0.022 | 0.005 |
| 1.704000000000005 | 0.093 | 0.022 | 0.005 |
| 1.708000000000005 | 0.092 | 0.021 | 0.005 |
| 1.712000000000005 | 0.091 | 0.021 | 0.005 |
| 1.716000000000005 | 0.09 | 0.021 | 0.005 |
| 1.720000000000005 | 0.089 | 0.02 | 0.005 |
| 1.724000000000005 | 0.088 | 0.02 | 0.005 |
| 1.728000000000005 | 0.087 | 0.02 | 0.004 |
| 1.732000000000005 | 0.086 | 0.019 | 0.004 |
| 1.736000000000005 | 0.085 | 0.019 | 0.004 |
| 1.740000000000005 | 0.084 | 0.019 | 0.004 |
| 1.744000000000005 | 0.083 | 0.018 | 0.004 |
| 1.748000000000005 | 0.082 | 0.018 | 0.004 |
| 1.752000000000005 | 0.081 | 0.018 | 0.004 |
| 1.756000000000005 | 0.08 | 0.017 | 0.004 |
| 1.760000000000005 | 0.079 | 0.017 | 0.004 |
| 1.764000000000005 | 0.079 | 0.017 | 0.003 |
| 1.768000000000005 | 0.078 | 0.016 | 0.003 |
| 1.772000000000005 | 0.077 | 0.016 | 0.003 |
| 1.776000000000005 | 0.076 | 0.016 | 0.003 |
| 1.780000000000005 | 0.075 | 0.015 | 0.003 |
| 1.784000000000005 | 0.074 | 0.015 | 0.003 |
| 1.788000000000005 | 0.073 | 0.015 | 0.003 |
| 1.792000000000005 | 0.072 | 0.015 | 0.003 |
| 1.796000000000005 | 0.071 | 0.014 | 0.003 |
| 1.800000000000005 | 0.07 | 0.014 | 0.003 |
| 1.804000000000005 | 0.07 | 0.014 | 0.003 |
| 1.808000000000005 | 0.069 | 0.013 | 0.003 |
| 1.812000000000005 | 0.068 | 0.013 | 0.003 |
| 1.816000000000005 | 0.067 | 0.013 | 0.002 |
| 1.820000000000005 | 0.066 | 0.013 | 0.002 |
| 1.824000000000005 | 0.065 | 0.012 | 0.002 |
| 1.828000000000005 | 0.065 | 0.012 | 0.002 |
| 1.832000000000005 | 0.064 | 0.012 | 0.002 |
| 1.836000000000005 | 0.063 | 0.012 | 0.002 |
| 1.840000000000005 | 0.062 | 0.011 | 0.002 |
| 1.844000000000005 | 0.062 | 0.011 | 0.002 |
| 1.848000000000005 | 0.061 | 0.011 | 0.002 |
| 1.852000000000005 | 0.06 | 0.011 | 0.002 |
| 1.856000000000005 | 0.059 | 0.011 | 0.002 |
| 1.860000000000005 | 0.058 | 0.01 | 0.002 |
| 1.864000000000005 | 0.058 | 0.01 | 0.002 |
| 1.868000000000005 | 0.057 | 0.01 | 0.002 |
| 1.872000000000005 | 0.056 | 0.01 | 0.002 |
| 1.876000000000005 | 0.056 | 0.01 | 0.002 |
| 1.880000000000005 | 0.055 | 0.009 | 0.002 |
| 1.884000000000005 | 0.054 | 0.009 | 0.002 |
| 1.888000000000005 | 0.053 | 0.009 | 0.002 |
| 1.892000000000005 | 0.053 | 0.009 | 0.001 |
| 1.896000000000005 | 0.052 | 0.009 | 0.001 |
| 1.900000000000005 | 0.051 | 0.008 | 0.001 |
| 1.904000000000005 | 0.051 | 0.008 | 0.001 |
| 1.908000000000005 | 0.05 | 0.008 | 0.001 |
| 1.912000000000005 | 0.049 | 0.008 | 0.001 |
| 1.916000000000005 | 0.049 | 0.008 | 0.001 |
| 1.920000000000005 | 0.048 | 0.008 | 0.001 |
| 1.924000000000005 | 0.047 | 0.007 | 0.001 |
| 1.928000000000005 | 0.047 | 0.007 | 0.001 |
| 1.932000000000005 | 0.046 | 0.007 | 0.001 |
| 1.936000000000005 | 0.046 | 0.007 | 0.001 |
| 1.940000000000005 | 0.045 | 0.007 | 0.001 |
| 1.944000000000005 | 0.044 | 0.007 | 0.001 |
| 1.948000000000005 | 0.044 | 0.007 | 0.001 |
| 1.952000000000005 | 0.043 | 0.006 | 0.001 |
| 1.956000000000005 | 0.043 | 0.006 | 0.001 |
| 1.960000000000005 | 0.042 | 0.006 | 0.001 |
| 1.964000000000005 | 0.041 | 0.006 | 0.001 |
| 1.968000000000005 | 0.041 | 0.006 | 0.001 |
| 1.972000000000005 | 0.04 | 0.006 | 0.001 |
| 1.976000000000005 | 0.04 | 0.006 | 0.001 |
| 1.980000000000005 | 0.039 | 0.006 | 0.001 |
| 1.984000000000005 | 0.039 | 0.005 | 0.001 |
| 1.988000000000005 | 0.038 | 0.005 | 0.001 |
| 1.992000000000005 | 0.038 | 0.005 | 0.001 |
| 1.996000000000005 | 0.037 | 0.005 | 0.001 |
| 2.000000000000005 | 0.037 | 0.005 | 0.001 |
| 2.004000000000005 | 0.036 | 0.005 | 0.001 |
| 2.008000000000005 | 0.036 | 0.005 | 0.001 |
| 2.012000000000005 | 0.035 | 0.005 | 0.001 |
| 2.016000000000005 | 0.035 | 0.005 | 0.001 |
| 2.020000000000005 | 0.034 | 0.004 | 0.001 |
| 2.024000000000005 | 0.034 | 0.004 | 0.001 |
| 2.028000000000005 | 0.033 | 0.004 | 0.001 |
| 2.032000000000005 | 0.033 | 0.004 | 0.001 |
| 2.036000000000005 | 0.032 | 0.004 | 0.001 |
| 2.040000000000005 | 0.032 | 0.004 | 0 |
| 2.044000000000005 | 0.031 | 0.004 | 0 |
| 2.048000000000005 | 0.031 | 0.004 | 0 |
| 2.052000000000005 | 0.03 | 0.004 | 0 |
| 2.056000000000005 | 0.03 | 0.004 | 0 |
| 2.060000000000005 | 0.03 | 0.004 | 0 |
| 2.064000000000005 | 0.029 | 0.003 | 0 |
| 2.068000000000005 | 0.029 | 0.003 | 0 |
| 2.072000000000005 | 0.028 | 0.003 | 0 |
| 2.076000000000005 | 0.028 | 0.003 | 0 |
| 2.080000000000005 | 0.027 | 0.003 | 0 |
| 2.084000000000005 | 0.027 | 0.003 | 0 |
| 2.088000000000005 | 0.027 | 0.003 | 0 |
| 2.092000000000005 | 0.026 | 0.003 | 0 |
| 2.096000000000005 | 0.026 | 0.003 | 0 |
| 2.100000000000005 | 0.026 | 0.003 | 0 |
| 2.104000000000005 | 0.025 | 0.003 | 0 |
| 2.108000000000005 | 0.025 | 0.003 | 0 |
| 2.112000000000005 | 0.024 | 0.003 | 0 |
| 2.116000000000005 | 0.024 | 0.003 | 0 |
| 2.120000000000005 | 0.024 | 0.003 | 0 |
| 2.124000000000005 | 0.023 | 0.002 | 0 |
| 2.128000000000005 | 0.023 | 0.002 | 0 |
| 2.132000000000005 | 0.023 | 0.002 | 0 |
| 2.136000000000005 | 0.022 | 0.002 | 0 |
| 2.140000000000005 | 0.022 | 0.002 | 0 |
| 2.144000000000005 | 0.022 | 0.002 | 0 |
| 2.148000000000005 | 0.021 | 0.002 | 0 |
| 2.152000000000005 | 0.021 | 0.002 | 0 |
| 2.156000000000005 | 0.021 | 0.002 | 0 |
| 2.160000000000005 | 0.02 | 0.002 | 0 |
| 2.164000000000005 | 0.02 | 0.002 | 0 |
| 2.168000000000005 | 0.02 | 0.002 | 0 |
| 2.172000000000005 | 0.019 | 0.002 | 0 |
| 2.176000000000005 | 0.019 | 0.002 | 0 |
| 2.180000000000005 | 0.019 | 0.002 | 0 |
| 2.184000000000005 | 0.019 | 0.002 | 0 |
| 2.188000000000005 | 0.018 | 0.002 | 0 |
| 2.192000000000005 | 0.018 | 0.002 | 0 |
| 2.196000000000005 | 0.018 | 0.002 | 0 |
| 2.200000000000005 | 0.017 | 0.002 | 0 |
| 2.204000000000005 | 0.017 | 0.002 | 0 |
| 2.208000000000005 | 0.017 | 0.001 | 0 |
| 2.212000000000005 | 0.017 | 0.001 | 0 |
| 2.216000000000005 | 0.016 | 0.001 | 0 |
| 2.220000000000005 | 0.016 | 0.001 | 0 |
| 2.224000000000005 | 0.016 | 0.001 | 0 |
| 2.228000000000005 | 0.016 | 0.001 | 0 |
| 2.232000000000005 | 0.015 | 0.001 | 0 |
| 2.236000000000005 | 0.015 | 0.001 | 0 |
| 2.240000000000005 | 0.015 | 0.001 | 0 |
| 2.244000000000005 | 0.015 | 0.001 | 0 |
| 2.248000000000005 | 0.014 | 0.001 | 0 |
| 2.252000000000005 | 0.014 | 0.001 | 0 |
| 2.256000000000005 | 0.014 | 0.001 | 0 |
| 2.260000000000005 | 0.014 | 0.001 | 0 |
| 2.264000000000005 | 0.013 | 0.001 | 0 |
| 2.268000000000005 | 0.013 | 0.001 | 0 |
| 2.272000000000005 | 0.013 | 0.001 | 0 |
| 2.276000000000005 | 0.013 | 0.001 | 0 |
| 2.280000000000005 | 0.013 | 0.001 | 0 |
| 2.284000000000005 | 0.012 | 0.001 | 0 |
| 2.288000000000005 | 0.012 | 0.001 | 0 |
| 2.292000000000005 | 0.012 | 0.001 | 0 |
| 2.296000000000005 | 0.012 | 0.001 | 0 |
| 2.300000000000005 | 0.012 | 0.001 | 0 |
| 2.304000000000005 | 0.011 | 0.001 | 0 |
| 2.308000000000005 | 0.011 | 0.001 | 0 |
| 2.312000000000005 | 0.011 | 0.001 | 0 |
| 2.316000000000005 | 0.011 | 0.001 | 0 |
| 2.320000000000005 | 0.011 | 0.001 | 0 |
| 2.324000000000005 | 0.01 | 0.001 | 0 |
| 2.328000000000005 | 0.01 | 0.001 | 0 |
| 2.332000000000005 | 0.01 | 0.001 | 0 |
| 2.336000000000005 | 0.01 | 0.001 | 0 |
| 2.340000000000005 | 0.01 | 0.001 | 0 |
| 2.344000000000005 | 0.01 | 0.001 | 0 |
| 2.348000000000005 | 0.009 | 0.001 | 0 |
| 2.352000000000005 | 0.009 | 0.001 | 0 |
| 2.356000000000005 | 0.009 | 0.001 | 0 |
| 2.360000000000005 | 0.009 | 0.001 | 0 |
| 2.364000000000005 | 0.009 | 0.001 | 0 |
| 2.368000000000005 | 0.009 | 0.001 | 0 |
| 2.372000000000005 | 0.009 | 0.001 | 0 |
| 2.376000000000005 | 0.008 | 0 | 0 |
| 2.380000000000005 | 0.008 | 0 | 0 |
| 2.384000000000005 | 0.008 | 0 | 0 |
| 2.388000000000005 | 0.008 | 0 | 0 |
| 2.392000000000005 | 0.008 | 0 | 0 |
| 2.396000000000005 | 0.008 | 0 | 0 |
| 2.400000000000005 | 0.008 | 0 | 0 |
| 2.404000000000005 | 0.007 | 0 | 0 |
| 2.408000000000005 | 0.007 | 0 | 0 |
| 2.412000000000005 | 0.007 | 0 | 0 |
| 2.416000000000005 | 0.007 | 0 | 0 |
| 2.420000000000005 | 0.007 | 0 | 0 |
| 2.424000000000005 | 0.007 | 0 | 0 |
| 2.428000000000005 | 0.007 | 0 | 0 |
| 2.432000000000005 | 0.007 | 0 | 0 |
| 2.436000000000005 | 0.006 | 0 | 0 |
| 2.440000000000005 | 0.006 | 0 | 0 |
| 2.444000000000005 | 0.006 | 0 | 0 |
| 2.448000000000005 | 0.006 | 0 | 0 |
| 2.452000000000005 | 0.006 | 0 | 0 |
| 2.456000000000005 | 0.006 | 0 | 0 |
| 2.460000000000005 | 0.006 | 0 | 0 |
| 2.464000000000005 | 0.006 | 0 | 0 |
| 2.468000000000005 | 0.006 | 0 | 0 |
| 2.472000000000005 | 0.005 | 0 | 0 |
| 2.476000000000005 | 0.005 | 0 | 0 |
| 2.480000000000005 | 0.005 | 0 | 0 |
| 2.484000000000005 | 0.005 | 0 | 0 |
| 2.488000000000005 | 0.005 | 0 | 0 |
| 2.492000000000005 | 0.005 | 0 | 0 |
| 2.496000000000005 | 0.005 | 0 | 0 |
| 2.500000000000005 | 0.005 | 0 | 0 |
| 2.504000000000005 | 0.005 | 0 | 0 |
| 2.508000000000005 | 0.005 | 0 | 0 |
| 2.512000000000005 | 0.005 | 0 | 0 |
| 2.516000000000005 | 0.004 | 0 | 0 |
| 2.520000000000005 | 0.004 | 0 | 0 |
| 2.524000000000005 | 0.004 | 0 | 0 |
| 2.528000000000005 | 0.004 | 0 | 0 |
| 2.532000000000005 | 0.004 | 0 | 0 |
| 2.536000000000005 | 0.004 | 0 | 0 |
| 2.540000000000005 | 0.004 | 0 | 0 |
| 2.544000000000005 | 0.004 | 0 | 0 |
| 2.548000000000005 | 0.004 | 0 | 0 |
| 2.552000000000005 | 0.004 | 0 | 0 |
| 2.556000000000005 | 0.004 | 0 | 0 |
| 2.560000000000005 | 0.004 | 0 | 0 |
| 2.564000000000005 | 0.004 | 0 | 0 |
| 2.568000000000005 | 0.004 | 0 | 0 |
| 2.572000000000005 | 0.003 | 0 | 0 |
| 2.576000000000005 | 0.003 | 0 | 0 |
| 2.580000000000005 | 0.003 | 0 | 0 |
| 2.584000000000005 | 0.003 | 0 | 0 |
| 2.588000000000005 | 0.003 | 0 | 0 |
| 2.592000000000005 | 0.003 | 0 | 0 |
| 2.596000000000005 | 0.003 | 0 | 0 |
| 2.600000000000005 | 0.003 | 0 | 0 |
| 2.604000000000005 | 0.003 | 0 | 0 |
| 2.608000000000005 | 0.003 | 0 | 0 |
| 2.612000000000005 | 0.003 | 0 | 0 |
| 2.616000000000005 | 0.003 | 0 | 0 |
| 2.620000000000005 | 0.003 | 0 | 0 |
| 2.624000000000005 | 0.003 | 0 | 0 |
| 2.628000000000005 | 0.003 | 0 | 0 |
| 2.632000000000005 | 0.003 | 0 | 0 |
| 2.636000000000005 | 0.003 | 0 | 0 |
| 2.640000000000005 | 0.002 | 0 | 0 |
| 2.644000000000005 | 0.002 | 0 | 0 |
| 2.648000000000005 | 0.002 | 0 | 0 |
| 2.652000000000005 | 0.002 | 0 | 0 |
| 2.656000000000005 | 0.002 | 0 | 0 |
| 2.660000000000005 | 0.002 | 0 | 0 |
| 2.664000000000005 | 0.002 | 0 | 0 |
| 2.668000000000005 | 0.002 | 0 | 0 |
| 2.672000000000005 | 0.002 | 0 | 0 |
| 2.676000000000005 | 0.002 | 0 | 0 |
| 2.680000000000005 | 0.002 | 0 | 0 |
| 2.684000000000005 | 0.002 | 0 | 0 |
| 2.688000000000005 | 0.002 | 0 | 0 |
| 2.692000000000005 | 0.002 | 0 | 0 |
| 2.696000000000005 | 0.002 | 0 | 0 |
| 2.700000000000005 | 0.002 | 0 | 0 |
| 2.704000000000005 | 0.002 | 0 | 0 |
| 2.708000000000005 | 0.002 | 0 | 0 |
| 2.712000000000005 | 0.002 | 0 | 0 |
| 2.716000000000005 | 0.002 | 0 | 0 |
| 2.720000000000005 | 0.002 | 0 | 0 |
| 2.724000000000005 | 0.002 | 0 | 0 |
| 2.728000000000005 | 0.002 | 0 | 0 |
| 2.732000000000005 | 0.002 | 0 | 0 |
| 2.736000000000005 | 0.002 | 0 | 0 |
| 2.740000000000005 | 0.002 | 0 | 0 |
| 2.744000000000005 | 0.001 | 0 | 0 |
| 2.748000000000005 | 0.001 | 0 | 0 |
| 2.752000000000005 | 0.001 | 0 | 0 |
| 2.756000000000005 | 0.001 | 0 | 0 |
| 2.760000000000005 | 0.001 | 0 | 0 |
| 2.764000000000005 | 0.001 | 0 | 0 |
| 2.768000000000005 | 0.001 | 0 | 0 |
| 2.772000000000005 | 0.001 | 0 | 0 |
| 2.776000000000005 | 0.001 | 0 | 0 |
| 2.780000000000005 | 0.001 | 0 | 0 |
| 2.784000000000005 | 0.001 | 0 | 0 |
| 2.788000000000006 | 0.001 | 0 | 0 |
| 2.792000000000005 | 0.001 | 0 | 0 |
| 2.796000000000005 | 0.001 | 0 | 0 |
| 2.800000000000006 | 0.001 | 0 | 0 |
| 2.804000000000006 | 0.001 | 0 | 0 |
| 2.808000000000006 | 0.001 | 0 | 0 |
| 2.812000000000006 | 0.001 | 0 | 0 |
| 2.816000000000006 | 0.001 | 0 | 0 |
| 2.820000000000006 | 0.001 | 0 | 0 |
| 2.824000000000006 | 0.001 | 0 | 0 |
| 2.828000000000006 | 0.001 | 0 | 0 |
| 2.832000000000006 | 0.001 | 0 | 0 |
| 2.836000000000006 | 0.001 | 0 | 0 |
| 2.840000000000006 | 0.001 | 0 | 0 |
| 2.844000000000006 | 0.001 | 0 | 0 |
| 2.848000000000006 | 0.001 | 0 | 0 |
| 2.852000000000006 | 0.001 | 0 | 0 |
| 2.856000000000006 | 0.001 | 0 | 0 |
| 2.860000000000006 | 0.001 | 0 | 0 |
| 2.864000000000006 | 0.001 | 0 | 0 |
| 2.868000000000006 | 0.001 | 0 | 0 |
| 2.872000000000006 | 0.001 | 0 | 0 |
| 2.876000000000006 | 0.001 | 0 | 0 |
| 2.880000000000006 | 0.001 | 0 | 0 |
| 2.884000000000006 | 0.001 | 0 | 0 |
| 2.888000000000006 | 0.001 | 0 | 0 |
| 2.892000000000006 | 0.001 | 0 | 0 |
| 2.896000000000006 | 0.001 | 0 | 0 |
| 2.900000000000006 | 0.001 | 0 | 0 |
| 2.904000000000006 | 0.001 | 0 | 0 |
| 2.908000000000006 | 0.001 | 0 | 0 |
| 2.912000000000006 | 0.001 | 0 | 0 |
| 2.916000000000006 | 0.001 | 0 | 0 |
| 2.920000000000006 | 0.001 | 0 | 0 |
| 2.924000000000006 | 0.001 | 0 | 0 |
| 2.928000000000006 | 0.001 | 0 | 0 |
| 2.932000000000006 | 0.001 | 0 | 0 |
| 2.936000000000006 | 0.001 | 0 | 0 |
| 2.940000000000006 | 0.001 | 0 | 0 |
| 2.944000000000006 | 0.001 | 0 | 0 |
| 2.948000000000006 | 0 | 0 | 0 |
| 2.952000000000006 | 0 | 0 | 0 |
| 2.956000000000006 | 0 | 0 | 0 |
| 2.960000000000006 | 0 | 0 | 0 |
| 2.964000000000006 | 0 | 0 | 0 |
| 2.968000000000006 | 0 | 0 | 0 |
| 2.972000000000006 | 0 | 0 | 0 |
| 2.976000000000006 | 0 | 0 | 0 |
| 2.980000000000006 | 0 | 0 | 0 |
| 2.984000000000006 | 0 | 0 | 0 |
| 2.988000000000006 | 0 | 0 | 0 |
| 2.992000000000006 | 0 | 0 | 0 |
| 2.996000000000006 | 0 | 0 | 0 |
| 3.000000000000006 | 0 | 0 | 0 |
| 3.004000000000006 | 0 | 0 | 0 |
| 3.008000000000006 | 0 | 0 | 0 |
| 3.012000000000006 | 0 | 0 | 0 |
| 3.016000000000006 | 0 | 0 | 0 |
| 3.020000000000006 | 0 | 0 | 0 |
| 3.024000000000006 | 0 | 0 | 0 |
| 3.028000000000006 | 0 | 0 | 0 |
| 3.032000000000006 | 0 | 0 | 0 |
| 3.036000000000006 | 0 | 0 | 0 |
| 3.040000000000006 | 0 | 0 | 0 |
| 3.044000000000006 | 0 | 0 | 0 |
| 3.048000000000006 | 0 | 0 | 0 |
| 3.052000000000006 | 0 | 0 | 0 |
| 3.056000000000006 | 0 | 0 | 0 |
| 3.060000000000006 | 0 | 0 | 0 |
| 3.064000000000006 | 0 | 0 | 0 |
| 3.068000000000006 | 0 | 0 | 0 |
| 3.072000000000006 | 0 | 0 | 0 |
| 3.076000000000006 | 0 | 0 | 0 |
| 3.080000000000006 | 0 | 0 | 0 |
| 3.084000000000006 | 0 | 0 | 0 |
| 3.088000000000006 | 0 | 0 | 0 |
| 3.092000000000006 | 0 | 0 | 0 |
| 3.096000000000006 | 0 | 0 | 0 |
| 3.100000000000006 | 0 | 0 | 0 |
| 3.104000000000006 | 0 | 0 | 0 |
| 3.108000000000006 | 0 | 0 | 0 |
| 3.112000000000006 | 0 | 0 | 0 |
| 3.116000000000006 | 0 | 0 | 0 |
| 3.120000000000006 | 0 | 0 | 0 |
| 3.124000000000006 | 0 | 0 | 0 |
| 3.128000000000006 | 0 | 0 | 0 |
| 3.132000000000006 | 0 | 0 | 0 |
| 3.136000000000006 | 0 | 0 | 0 |
| 3.140000000000006 | 0 | 0 | 0 |
| 3.144000000000006 | 0 | 0 | 0 |
| 3.148000000000006 | 0 | 0 | 0 |
| 3.152000000000006 | 0 | 0 | 0 |
| 3.156000000000006 | 0 | 0 | 0 |
| 3.160000000000006 | 0 | 0 | 0 |
| 3.164000000000006 | 0 | 0 | 0 |
| 3.168000000000006 | 0 | 0 | 0 |
| 3.172000000000006 | 0 | 0 | 0 |
| 3.176000000000006 | 0 | 0 | 0 |
| 3.180000000000006 | 0 | 0 | 0 |
| 3.184000000000006 | 0 | 0 | 0 |
| 3.188000000000006 | 0 | 0 | 0 |
| 3.192000000000006 | 0 | 0 | 0 |
| 3.196000000000006 | 0 | 0 | 0 |
| 3.200000000000006 | 0 | 0 | 0 |
| 3.204000000000006 | 0 | 0 | 0 |
| 3.208000000000006 | 0 | 0 | 0 |
| 3.212000000000006 | 0 | 0 | 0 |
| 3.216000000000006 | 0 | 0 | 0 |
| 3.220000000000006 | 0 | 0 | 0 |
| 3.224000000000006 | 0 | 0 | 0 |
| 3.228000000000006 | 0 | 0 | 0 |
| 3.232000000000006 | 0 | 0 | 0 |
| 3.236000000000006 | 0 | 0 | 0 |
| 3.240000000000006 | 0 | 0 | 0 |
| 3.244000000000006 | 0 | 0 | 0 |
| 3.248000000000006 | 0 | 0 | 0 |
| 3.252000000000006 | 0 | 0 | 0 |
| 3.256000000000006 | 0 | 0 | 0 |
| 3.260000000000006 | 0 | 0 | 0 |
| 3.264000000000006 | 0 | 0 | 0 |
| 3.268000000000006 | 0 | 0 | 0 |
| 3.272000000000006 | 0 | 0 | 0 |
| 3.276000000000006 | 0 | 0 | 0 |
| 3.280000000000006 | 0 | 0 | 0 |
| 3.284000000000006 | 0 | 0 | 0 |
| 3.288000000000006 | 0 | 0 | 0 |
| 3.292000000000006 | 0 | 0 | 0 |
| 3.296000000000006 | 0 | 0 | 0 |
| 3.300000000000006 | 0 | 0 | 0 |
| 3.304000000000006 | 0 | 0 | 0 |
| 3.308000000000006 | 0 | 0 | 0 |
| 3.312000000000006 | 0 | 0 | 0 |
| 3.316000000000006 | 0 | 0 | 0 |
| 3.320000000000006 | 0 | 0 | 0 |
| 3.324000000000006 | 0 | 0 | 0 |
| 3.328000000000006 | 0 | 0 | 0 |
| 3.332000000000006 | 0 | 0 | 0 |
| 3.336000000000006 | 0 | 0 | 0 |
| 3.340000000000006 | 0 | 0 | 0 |
| 3.344000000000006 | 0 | 0 | 0 |
| 3.348000000000006 | 0 | 0 | 0 |
| 3.352000000000006 | 0 | 0 | 0 |
| 3.356000000000006 | 0 | 0 | 0 |
| 3.360000000000006 | 0 | 0 | 0 |
| 3.364000000000006 | 0 | 0 | 0 |
| 3.368000000000006 | 0 | 0 | 0 |
| 3.372000000000006 | 0 | 0 | 0 |
| 3.376000000000006 | 0 | 0 | 0 |
| 3.380000000000006 | 0 | 0 | 0 |
| 3.384000000000006 | 0 | 0 | 0 |
| 3.388000000000006 | 0 | 0 | 0 |
| 3.392000000000006 | 0 | 0 | 0 |
| 3.396000000000006 | 0 | 0 | 0 |
| 3.400000000000006 | 0 | 0 | 0 |
| 3.404000000000006 | 0 | 0 | 0 |
| 3.408000000000006 | 0 | 0 | 0 |
| 3.412000000000006 | 0 | 0 | 0 |
| 3.416000000000006 | 0 | 0 | 0 |
| 3.420000000000006 | 0 | 0 | 0 |
| 3.424000000000006 | 0 | 0 | 0 |
| 3.428000000000006 | 0 | 0 | 0 |
| 3.432000000000006 | 0 | 0 | 0 |
| 3.436000000000006 | 0 | 0 | 0 |
| 3.440000000000006 | 0 | 0 | 0 |
| 3.444000000000006 | 0 | 0 | 0 |
| 3.448000000000006 | 0 | 0 | 0 |
| 3.452000000000006 | 0 | 0 | 0 |
| 3.456000000000006 | 0 | 0 | 0 |
| 3.460000000000006 | 0 | 0 | 0 |
| 3.464000000000006 | 0 | 0 | 0 |
| 3.468000000000006 | 0 | 0 | 0 |
| 3.472000000000006 | 0 | 0 | 0 |
| 3.476000000000006 | 0 | 0 | 0 |
| 3.480000000000006 | 0 | 0 | 0 |
| 3.484000000000006 | 0 | 0 | 0 |
| 3.488000000000006 | 0 | 0 | 0 |
| 3.492000000000006 | 0 | 0 | 0 |
| 3.496000000000006 | 0 | 0 | 0 |
| 3.500000000000006 | 0 | 0 | 0 |
| 3.504000000000006 | 0 | 0 | 0 |
| 3.508000000000006 | 0 | 0 | 0 |
| 3.512000000000006 | 0 | 0 | 0 |
| 3.516000000000006 | 0 | 0 | 0 |
| 3.520000000000006 | 0 | 0 | 0 |
| 3.524000000000006 | 0 | 0 | 0 |
| 3.528000000000006 | 0 | 0 | 0 |
| 3.532000000000006 | 0 | 0 | 0 |
| 3.536000000000006 | 0 | 0 | 0 |
| 3.540000000000006 | 0 | 0 | 0 |
| 3.544000000000006 | 0 | 0 | 0 |
| 3.548000000000006 | 0 | 0 | 0 |
| 3.552000000000006 | 0 | 0 | 0 |
| 3.556000000000006 | 0 | 0 | 0 |
| 3.560000000000006 | 0 | 0 | 0 |
| 3.564000000000006 | 0 | 0 | 0 |
| 3.568000000000006 | 0 | 0 | 0 |
| 3.572000000000006 | 0 | 0 | 0 |
| 3.576000000000006 | 0 | 0 | 0 |
| 3.580000000000006 | 0 | 0 | 0 |
| 3.584000000000006 | 0 | 0 | 0 |
| 3.588000000000006 | 0 | 0 | 0 |
| 3.592000000000006 | 0 | 0 | 0 |
| 3.596000000000006 | 0 | 0 | 0 |
| 3.600000000000006 | 0 | 0 | 0 |
| 3.604000000000006 | 0 | 0 | 0 |
| 3.608000000000006 | 0 | 0 | 0 |
| 3.612000000000006 | 0 | 0 | 0 |
| 3.616000000000006 | 0 | 0 | 0 |
| 3.620000000000006 | 0 | 0 | 0 |
| 3.624000000000006 | 0 | 0 | 0 |
| 3.628000000000006 | 0 | 0 | 0 |
| 3.632000000000006 | 0 | 0 | 0 |
| 3.636000000000006 | 0 | 0 | 0 |
| 3.640000000000006 | 0 | 0 | 0 |
| 3.644000000000006 | 0 | 0 | 0 |
| 3.648000000000006 | 0 | 0 | 0 |
| 3.652000000000006 | 0 | 0 | 0 |
| 3.656000000000006 | 0 | 0 | 0 |
| 3.660000000000006 | 0 | 0 | 0 |
| 3.664000000000006 | 0 | 0 | 0 |
| 3.668000000000006 | 0 | 0 | 0 |
| 3.672000000000006 | 0 | 0 | 0 |
| 3.676000000000006 | 0 | 0 | 0 |
| 3.680000000000006 | 0 | 0 | 0 |
| 3.684000000000006 | 0 | 0 | 0 |
| 3.688000000000006 | 0 | 0 | 0 |
| 3.692000000000006 | 0 | 0 | 0 |
| 3.696000000000006 | 0 | 0 | 0 |
| 3.700000000000006 | 0 | 0 | 0 |
| 3.704000000000006 | 0 | 0 | 0 |
| 3.708000000000006 | 0 | 0 | 0 |
| 3.712000000000006 | 0 | 0 | 0 |
| 3.716000000000006 | 0 | 0 | 0 |
| 3.720000000000006 | 0 | 0 | 0 |
| 3.724000000000006 | 0 | 0 | 0 |
| 3.728000000000006 | 0 | 0 | 0 |
| 3.732000000000006 | 0 | 0 | 0 |
| 3.736000000000006 | 0 | 0 | 0 |
| 3.740000000000006 | 0 | 0 | 0 |
| 3.744000000000006 | 0 | 0 | 0 |
| 3.748000000000006 | 0 | 0 | 0 |
| 3.752000000000006 | 0 | 0 | 0 |
| 3.756000000000006 | 0 | 0 | 0 |
| 3.760000000000006 | 0 | 0 | 0 |
| 3.764000000000006 | 0 | 0 | 0 |
| 3.768000000000006 | 0 | 0 | 0 |
| 3.772000000000006 | 0 | 0 | 0 |
| 3.776000000000006 | 0 | 0 | 0 |
| 3.780000000000006 | 0 | 0 | 0 |
| 3.784000000000006 | 0 | 0 | 0 |
| 3.788000000000006 | 0 | 0 | 0 |
| 3.792000000000006 | 0 | 0 | 0 |
| 3.796000000000006 | 0 | 0 | 0 |
| 3.800000000000006 | 0 | 0 | 0 |
| 3.804000000000006 | 0 | 0 | 0 |
| 3.808000000000006 | 0 | 0 | 0 |
| 3.812000000000006 | 0 | 0 | 0 |
| 3.816000000000006 | 0 | 0 | 0 |
| 3.820000000000006 | 0 | 0 | 0 |
| 3.824000000000006 | 0 | 0 | 0 |
| 3.828000000000006 | 0 | 0 | 0 |
| 3.832000000000006 | 0 | 0 | 0 |
| 3.836000000000006 | 0 | 0 | 0 |
| 3.840000000000006 | 0 | 0 | 0 |
| 3.844000000000006 | 0 | 0 | 0 |
| 3.848000000000006 | 0 | 0 | 0 |
| 3.852000000000006 | 0 | 0 | 0 |
| 3.856000000000006 | 0 | 0 | 0 |
| 3.860000000000006 | 0 | 0 | 0 |
| 3.864000000000006 | 0 | 0 | 0 |
| 3.868000000000006 | 0 | 0 | 0 |
| 3.872000000000006 | 0 | 0 | 0 |
| 3.876000000000006 | 0 | 0 | 0 |
| 3.880000000000006 | 0 | 0 | 0 |
| 3.884000000000006 | 0 | 0 | 0 |
| 3.888000000000007 | 0 | 0 | 0 |
| 3.892000000000006 | 0 | 0 | 0 |
| 3.896000000000006 | 0 | 0 | 0 |
| 3.900000000000007 | 0 | 0 | 0 |
| 3.904000000000007 | 0 | 0 | 0 |
| 3.908000000000007 | 0 | 0 | 0 |
| 3.912000000000007 | 0 | 0 | 0 |
| 3.916000000000007 | 0 | 0 | 0 |
| 3.920000000000007 | 0 | 0 | 0 |
| 3.924000000000007 | 0 | 0 | 0 |
| 3.928000000000007 | 0 | 0 | 0 |
| 3.932000000000007 | 0 | 0 | 0 |
| 3.936000000000007 | 0 | 0 | 0 |
| 3.940000000000007 | 0 | 0 | 0 |
| 3.944000000000007 | 0 | 0 | 0 |
| 3.948000000000007 | 0 | 0 | 0 |
| 3.952000000000007 | 0 | 0 | 0 |
| 3.956000000000007 | 0 | 0 | 0 |
| 3.960000000000007 | 0 | 0 | 0 |
| 3.964000000000007 | 0 | 0 | 0 |
| 3.968000000000007 | 0 | 0 | 0 |
| 3.972000000000007 | 0 | 0 | 0 |
| 3.976000000000007 | 0 | 0 | 0 |
| 3.980000000000007 | 0 | 0 | 0 |
| 3.984000000000007 | 0 | 0 | 0 |
| 3.988000000000007 | 0 | 0 | 0 |
| 3.992000000000007 | 0 | 0 | 0 |
| 3.996000000000007 | 0 | 0 | 0 |
| 4.000000000000006 | 0 | 0 | 0 |